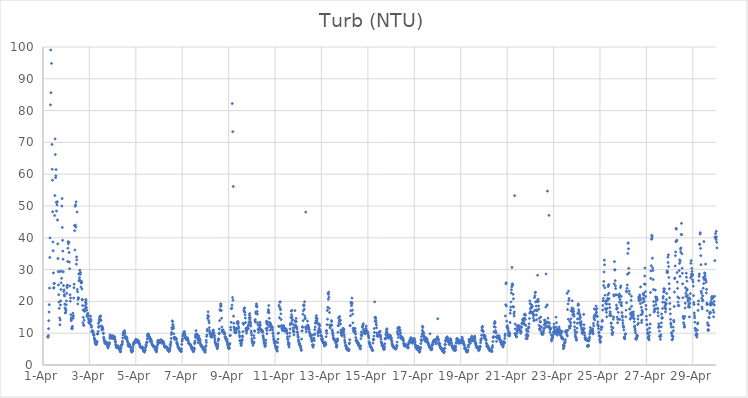
| Category | Turb (NTU) |
|---|---|
| 44287.208333333336 | 8.91 |
| 44287.21875 | 8.72 |
| 44287.229166666664 | 9.24 |
| 44287.239583333336 | 11.43 |
| 44287.25 | 13.94 |
| 44287.260416666664 | 16.67 |
| 44287.270833333336 | 18.98 |
| 44287.28125 | 24.19 |
| 44287.291666666664 | 33.81 |
| 44287.302083333336 | 39.97 |
| 44287.3125 | 102.34 |
| 44287.322916666664 | 81.81 |
| 44287.333333333336 | 99.06 |
| 44287.34375 | 85.61 |
| 44287.354166666664 | 104.05 |
| 44287.364583333336 | 94.84 |
| 44287.375 | 164.2 |
| 44287.385416666664 | 69.35 |
| 44287.395833333336 | 61.54 |
| 44287.40625 | 58.09 |
| 44287.416666666664 | 48.18 |
| 44287.427083333336 | 38.69 |
| 44287.4375 | 35.92 |
| 44287.447916666664 | 28.95 |
| 44287.458333333336 | 24.17 |
| 44287.46875 | 24.33 |
| 44287.479166666664 | 25.57 |
| 44287.489583333336 | 25.69 |
| 44287.5 | 47.01 |
| 44287.510416666664 | 53.28 |
| 44287.520833333336 | 71.09 |
| 44287.53125 | 66.18 |
| 44287.541666666664 | 58.92 |
| 44287.552083333336 | 59.51 |
| 44287.5625 | 61.44 |
| 44287.572916666664 | 51.14 |
| 44287.583333333336 | 48.4 |
| 44287.59375 | 51.13 |
| 44287.604166666664 | 50.33 |
| 44287.614583333336 | 51.34 |
| 44287.625 | 45.59 |
| 44287.635416666664 | 38.09 |
| 44287.645833333336 | 33.48 |
| 44287.65625 | 29.37 |
| 44287.666666666664 | 25.19 |
| 44287.677083333336 | 22.1 |
| 44287.6875 | 19.79 |
| 44287.697916666664 | 17.81 |
| 44287.708333333336 | 29.34 |
| 44287.71875 | 14.78 |
| 44287.729166666664 | 12.66 |
| 44287.739583333336 | 14.14 |
| 44287.75 | 18.86 |
| 44287.760416666664 | 20.18 |
| 44287.770833333336 | 23.73 |
| 44287.78125 | 25.83 |
| 44287.791666666664 | 29.49 |
| 44287.802083333336 | 27.25 |
| 44287.8125 | 49.99 |
| 44287.822916666664 | 52.34 |
| 44287.833333333336 | 43.26 |
| 44287.84375 | 39.22 |
| 44287.854166666664 | 35.82 |
| 44287.864583333336 | 33.27 |
| 44287.875 | 29.29 |
| 44287.885416666664 | 25 |
| 44287.895833333336 | 23.11 |
| 44287.90625 | 23.63 |
| 44287.916666666664 | 22.09 |
| 44287.927083333336 | 21.72 |
| 44287.9375 | 19.13 |
| 44287.947916666664 | 17.96 |
| 44287.958333333336 | 16.38 |
| 44287.96875 | 16.47 |
| 44287.979166666664 | 17.54 |
| 44287.989583333336 | 17.07 |
| 44288.0 | 18.92 |
| 44288.010416666664 | 20.16 |
| 44288.020833333336 | 22.56 |
| 44288.03125 | 24.86 |
| 44288.041666666664 | 24.35 |
| 44288.052083333336 | 25.1 |
| 44288.0625 | 32.56 |
| 44288.072916666664 | 36.73 |
| 44288.083333333336 | 38.78 |
| 44288.09375 | 38.14 |
| 44288.104166666664 | 38.54 |
| 44288.114583333336 | 38.61 |
| 44288.125 | 35.38 |
| 44288.135416666664 | 32.38 |
| 44288.145833333336 | 30.26 |
| 44288.15625 | 24.86 |
| 44288.166666666664 | 22.07 |
| 44288.177083333336 | 20.05 |
| 44288.1875 | 21.08 |
| 44288.197916666664 | 15.83 |
| 44288.208333333336 | 14.74 |
| 44288.21875 | 13.92 |
| 44288.229166666664 | 14.4 |
| 44288.239583333336 | 11.45 |
| 44288.25 | 11.78 |
| 44288.260416666664 | 11.39 |
| 44288.270833333336 | 12.16 |
| 44288.28125 | 15.26 |
| 44288.291666666664 | 16.3 |
| 44288.302083333336 | 14.73 |
| 44288.3125 | 15.52 |
| 44288.322916666664 | 21.05 |
| 44288.333333333336 | 24.31 |
| 44288.34375 | 25.4 |
| 44288.354166666664 | 43.85 |
| 44288.364583333336 | 42.23 |
| 44288.375 | 36.16 |
| 44288.385416666664 | 49.9 |
| 44288.395833333336 | 43.97 |
| 44288.40625 | 50.39 |
| 44288.416666666664 | 43.36 |
| 44288.427083333336 | 51.3 |
| 44288.4375 | 31.7 |
| 44288.447916666664 | 33.98 |
| 44288.458333333336 | 33.05 |
| 44288.46875 | 48.1 |
| 44288.479166666664 | 23.76 |
| 44288.489583333336 | 23.02 |
| 44288.5 | 19.2 |
| 44288.510416666664 | 20.63 |
| 44288.520833333336 | 21.19 |
| 44288.53125 | 21.06 |
| 44288.541666666664 | 28.63 |
| 44288.552083333336 | 26.62 |
| 44288.5625 | 26.48 |
| 44288.572916666664 | 27.46 |
| 44288.583333333336 | 29.78 |
| 44288.59375 | 28.84 |
| 44288.604166666664 | 28.49 |
| 44288.614583333336 | 29.09 |
| 44288.625 | 26.51 |
| 44288.635416666664 | 24.52 |
| 44288.645833333336 | 25.8 |
| 44288.65625 | 25.92 |
| 44288.666666666664 | 26.17 |
| 44288.677083333336 | 23.9 |
| 44288.6875 | 20.65 |
| 44288.697916666664 | 20.52 |
| 44288.708333333336 | 18.7 |
| 44288.71875 | 13.26 |
| 44288.729166666664 | 17.31 |
| 44288.739583333336 | 14.97 |
| 44288.75 | 12.45 |
| 44288.760416666664 | 12.56 |
| 44288.770833333336 | 14.08 |
| 44288.78125 | 17.08 |
| 44288.791666666664 | 16.86 |
| 44288.802083333336 | 17.09 |
| 44288.8125 | 18.61 |
| 44288.822916666664 | 17.75 |
| 44288.833333333336 | 19.64 |
| 44288.84375 | 20.57 |
| 44288.854166666664 | 20.09 |
| 44288.864583333336 | 19.21 |
| 44288.875 | 18.07 |
| 44288.885416666664 | 17.25 |
| 44288.895833333336 | 15.66 |
| 44288.90625 | 15.28 |
| 44288.916666666664 | 15.57 |
| 44288.927083333336 | 16.29 |
| 44288.9375 | 15.74 |
| 44288.947916666664 | 15.57 |
| 44288.958333333336 | 14.56 |
| 44288.96875 | 13.37 |
| 44288.979166666664 | 14.01 |
| 44288.989583333336 | 13.63 |
| 44289.0 | 13.2 |
| 44289.010416666664 | 13.24 |
| 44289.020833333336 | 12.96 |
| 44289.03125 | 13.87 |
| 44289.041666666664 | 14.1 |
| 44289.052083333336 | 15.31 |
| 44289.0625 | 14.32 |
| 44289.072916666664 | 13.83 |
| 44289.083333333336 | 12.42 |
| 44289.09375 | 11.89 |
| 44289.104166666664 | 10.5 |
| 44289.114583333336 | 10.43 |
| 44289.125 | 10.82 |
| 44289.135416666664 | 10.29 |
| 44289.145833333336 | 10.62 |
| 44289.15625 | 10.64 |
| 44289.166666666664 | 10.15 |
| 44289.177083333336 | 9.63 |
| 44289.1875 | 9.27 |
| 44289.197916666664 | 9.47 |
| 44289.208333333336 | 8.46 |
| 44289.21875 | 8.19 |
| 44289.229166666664 | 7.53 |
| 44289.239583333336 | 8.1 |
| 44289.25 | 6.83 |
| 44289.260416666664 | 7.27 |
| 44289.270833333336 | 6.76 |
| 44289.28125 | 6.47 |
| 44289.291666666664 | 6.46 |
| 44289.302083333336 | 6.51 |
| 44289.3125 | 6.87 |
| 44289.322916666664 | 7.47 |
| 44289.333333333336 | 7.19 |
| 44289.34375 | 9.79 |
| 44289.354166666664 | 9.87 |
| 44289.364583333336 | 9.78 |
| 44289.375 | 10.56 |
| 44289.385416666664 | 13.07 |
| 44289.395833333336 | 11.84 |
| 44289.40625 | 12.15 |
| 44289.416666666664 | 14.19 |
| 44289.427083333336 | 13.6 |
| 44289.4375 | 15.07 |
| 44289.447916666664 | 14.41 |
| 44289.458333333336 | 14.48 |
| 44289.46875 | 15.32 |
| 44289.479166666664 | 15.41 |
| 44289.489583333336 | 14.07 |
| 44289.5 | 14.09 |
| 44289.510416666664 | 12.2 |
| 44289.520833333336 | 12.24 |
| 44289.53125 | 10.98 |
| 44289.541666666664 | 11.55 |
| 44289.552083333336 | 11.33 |
| 44289.5625 | 11.87 |
| 44289.572916666664 | 11.67 |
| 44289.583333333336 | 11.2 |
| 44289.59375 | 10.05 |
| 44289.604166666664 | 9.91 |
| 44289.614583333336 | 8.73 |
| 44289.625 | 8.25 |
| 44289.635416666664 | 7.83 |
| 44289.645833333336 | 7.73 |
| 44289.65625 | 7.22 |
| 44289.666666666664 | 7.1 |
| 44289.677083333336 | 6.79 |
| 44289.6875 | 6.76 |
| 44289.697916666664 | 7.11 |
| 44289.708333333336 | 7.02 |
| 44289.71875 | 6.75 |
| 44289.729166666664 | 7.21 |
| 44289.739583333336 | 6.53 |
| 44289.75 | 6.51 |
| 44289.760416666664 | 6.48 |
| 44289.770833333336 | 6.54 |
| 44289.78125 | 5.94 |
| 44289.791666666664 | 5.68 |
| 44289.802083333336 | 5.34 |
| 44289.8125 | 5.8 |
| 44289.822916666664 | 5.98 |
| 44289.833333333336 | 6.78 |
| 44289.84375 | 6.99 |
| 44289.854166666664 | 7 |
| 44289.864583333336 | 6.62 |
| 44289.875 | 8.41 |
| 44289.885416666664 | 9.08 |
| 44289.895833333336 | 9.49 |
| 44289.90625 | 9.19 |
| 44289.916666666664 | 9.03 |
| 44289.927083333336 | 8.88 |
| 44289.9375 | 8.56 |
| 44289.947916666664 | 8.35 |
| 44289.958333333336 | 8.95 |
| 44289.96875 | 8.65 |
| 44289.979166666664 | 8.78 |
| 44289.989583333336 | 8.98 |
| 44290.0 | 9.23 |
| 44290.010416666664 | 8.91 |
| 44290.020833333336 | 8.36 |
| 44290.03125 | 8.31 |
| 44290.041666666664 | 8.47 |
| 44290.052083333336 | 8.52 |
| 44290.0625 | 8.34 |
| 44290.072916666664 | 8.98 |
| 44290.083333333336 | 8.75 |
| 44290.09375 | 8.48 |
| 44290.104166666664 | 7.93 |
| 44290.114583333336 | 7.44 |
| 44290.125 | 7.07 |
| 44290.135416666664 | 6.42 |
| 44290.145833333336 | 6.02 |
| 44290.15625 | 5.95 |
| 44290.166666666664 | 5.48 |
| 44290.177083333336 | 5.58 |
| 44290.1875 | 5.41 |
| 44290.197916666664 | 5.56 |
| 44290.208333333336 | 5.7 |
| 44290.21875 | 5.94 |
| 44290.229166666664 | 5.97 |
| 44290.239583333336 | 5.97 |
| 44290.25 | 5.65 |
| 44290.260416666664 | 5.41 |
| 44290.270833333336 | 5.48 |
| 44290.28125 | 5.01 |
| 44290.291666666664 | 5.03 |
| 44290.302083333336 | 5.03 |
| 44290.3125 | 4.47 |
| 44290.322916666664 | 4.71 |
| 44290.333333333336 | 4.17 |
| 44290.34375 | 4.2 |
| 44290.354166666664 | 5.1 |
| 44290.364583333336 | 5.6 |
| 44290.375 | 6.12 |
| 44290.385416666664 | 6.22 |
| 44290.395833333336 | 6.41 |
| 44290.40625 | 6.48 |
| 44290.416666666664 | 6.93 |
| 44290.427083333336 | 7.47 |
| 44290.4375 | 8.5 |
| 44290.447916666664 | 9.44 |
| 44290.458333333336 | 9.98 |
| 44290.46875 | 10.38 |
| 44290.479166666664 | 10.08 |
| 44290.489583333336 | 10 |
| 44290.5 | 9.67 |
| 44290.510416666664 | 10.04 |
| 44290.520833333336 | 10.76 |
| 44290.53125 | 10.01 |
| 44290.541666666664 | 8.93 |
| 44290.552083333336 | 8.58 |
| 44290.5625 | 8.33 |
| 44290.572916666664 | 8.35 |
| 44290.583333333336 | 8.18 |
| 44290.59375 | 8.91 |
| 44290.604166666664 | 8.39 |
| 44290.614583333336 | 8.4 |
| 44290.625 | 8.31 |
| 44290.635416666664 | 7.54 |
| 44290.645833333336 | 7.44 |
| 44290.65625 | 7 |
| 44290.666666666664 | 6.43 |
| 44290.677083333336 | 5.89 |
| 44290.6875 | 6.58 |
| 44290.697916666664 | 6.7 |
| 44290.708333333336 | 6.26 |
| 44290.71875 | 5.95 |
| 44290.729166666664 | 6.19 |
| 44290.739583333336 | 6.39 |
| 44290.75 | 5.7 |
| 44290.760416666664 | 5.66 |
| 44290.770833333336 | 5.58 |
| 44290.78125 | 5.59 |
| 44290.791666666664 | 4.55 |
| 44290.802083333336 | 4.78 |
| 44290.8125 | 4.63 |
| 44290.822916666664 | 4.03 |
| 44290.833333333336 | 4.19 |
| 44290.84375 | 4.31 |
| 44290.854166666664 | 4.37 |
| 44290.864583333336 | 4.75 |
| 44290.875 | 5.4 |
| 44290.885416666664 | 6.14 |
| 44290.895833333336 | 6.68 |
| 44290.90625 | 6.6 |
| 44290.916666666664 | 6.98 |
| 44290.927083333336 | 6.98 |
| 44290.9375 | 7.15 |
| 44290.947916666664 | 7.17 |
| 44290.958333333336 | 7.32 |
| 44290.96875 | 7.63 |
| 44290.979166666664 | 7.11 |
| 44290.989583333336 | 7.49 |
| 44291.0 | 8.08 |
| 44291.010416666664 | 7.45 |
| 44291.020833333336 | 7.96 |
| 44291.03125 | 7.57 |
| 44291.041666666664 | 7.87 |
| 44291.052083333336 | 7.61 |
| 44291.0625 | 7.09 |
| 44291.072916666664 | 7.77 |
| 44291.083333333336 | 7.63 |
| 44291.09375 | 7.8 |
| 44291.104166666664 | 7.33 |
| 44291.114583333336 | 7.23 |
| 44291.125 | 7.39 |
| 44291.135416666664 | 7.06 |
| 44291.145833333336 | 6.78 |
| 44291.15625 | 6.65 |
| 44291.166666666664 | 6.38 |
| 44291.177083333336 | 5.99 |
| 44291.1875 | 5.89 |
| 44291.197916666664 | 5.72 |
| 44291.208333333336 | 5.53 |
| 44291.21875 | 5.5 |
| 44291.229166666664 | 5.47 |
| 44291.239583333336 | 5.5 |
| 44291.25 | 5.43 |
| 44291.260416666664 | 5.43 |
| 44291.270833333336 | 5.6 |
| 44291.28125 | 5.68 |
| 44291.291666666664 | 5.31 |
| 44291.302083333336 | 5.29 |
| 44291.3125 | 4.88 |
| 44291.322916666664 | 5.03 |
| 44291.333333333336 | 4.32 |
| 44291.34375 | 4.65 |
| 44291.354166666664 | 4.41 |
| 44291.364583333336 | 4.15 |
| 44291.375 | 4.05 |
| 44291.385416666664 | 4.43 |
| 44291.395833333336 | 4.67 |
| 44291.40625 | 4.67 |
| 44291.416666666664 | 5.51 |
| 44291.427083333336 | 5.58 |
| 44291.4375 | 6.37 |
| 44291.447916666664 | 6.09 |
| 44291.458333333336 | 7 |
| 44291.46875 | 7.14 |
| 44291.479166666664 | 7.13 |
| 44291.489583333336 | 8.17 |
| 44291.5 | 9.09 |
| 44291.510416666664 | 9.66 |
| 44291.520833333336 | 9.41 |
| 44291.53125 | 9.71 |
| 44291.541666666664 | 9.69 |
| 44291.552083333336 | 9.48 |
| 44291.5625 | 8.76 |
| 44291.572916666664 | 8.66 |
| 44291.583333333336 | 8.52 |
| 44291.59375 | 8.94 |
| 44291.604166666664 | 7.93 |
| 44291.614583333336 | 7.43 |
| 44291.625 | 8.19 |
| 44291.635416666664 | 8.21 |
| 44291.645833333336 | 8.2 |
| 44291.65625 | 7.59 |
| 44291.666666666664 | 7.8 |
| 44291.677083333336 | 7.37 |
| 44291.6875 | 6.85 |
| 44291.697916666664 | 6.6 |
| 44291.708333333336 | 6.42 |
| 44291.71875 | 6.24 |
| 44291.729166666664 | 6.16 |
| 44291.739583333336 | 6.13 |
| 44291.75 | 5.92 |
| 44291.760416666664 | 5.8 |
| 44291.770833333336 | 5.68 |
| 44291.78125 | 5.76 |
| 44291.791666666664 | 5.89 |
| 44291.802083333336 | 5.73 |
| 44291.8125 | 5.79 |
| 44291.822916666664 | 5.51 |
| 44291.833333333336 | 4.81 |
| 44291.84375 | 5.04 |
| 44291.854166666664 | 4.59 |
| 44291.864583333336 | 4.74 |
| 44291.875 | 4.44 |
| 44291.885416666664 | 4.1 |
| 44291.895833333336 | 4.36 |
| 44291.90625 | 5.07 |
| 44291.916666666664 | 5.58 |
| 44291.927083333336 | 6.19 |
| 44291.9375 | 7.08 |
| 44291.947916666664 | 7.74 |
| 44291.958333333336 | 7.15 |
| 44291.96875 | 6.77 |
| 44291.979166666664 | 7.27 |
| 44291.989583333336 | 7.61 |
| 44292.0 | 7.34 |
| 44292.010416666664 | 7.15 |
| 44292.020833333336 | 7.02 |
| 44292.03125 | 7.28 |
| 44292.041666666664 | 7.62 |
| 44292.052083333336 | 7.39 |
| 44292.0625 | 7.65 |
| 44292.072916666664 | 7.68 |
| 44292.083333333336 | 7.97 |
| 44292.09375 | 7.8 |
| 44292.104166666664 | 7.69 |
| 44292.114583333336 | 6.99 |
| 44292.125 | 6.85 |
| 44292.135416666664 | 7.48 |
| 44292.145833333336 | 7.43 |
| 44292.15625 | 7.03 |
| 44292.166666666664 | 7.26 |
| 44292.177083333336 | 7.42 |
| 44292.1875 | 7.2 |
| 44292.197916666664 | 6.98 |
| 44292.208333333336 | 6.84 |
| 44292.21875 | 6.34 |
| 44292.229166666664 | 6.11 |
| 44292.239583333336 | 5.68 |
| 44292.25 | 5.81 |
| 44292.260416666664 | 5.67 |
| 44292.270833333336 | 5.59 |
| 44292.28125 | 5.61 |
| 44292.291666666664 | 5.52 |
| 44292.302083333336 | 5.46 |
| 44292.3125 | 5.67 |
| 44292.322916666664 | 5.68 |
| 44292.333333333336 | 5.57 |
| 44292.34375 | 5.34 |
| 44292.354166666664 | 5.23 |
| 44292.364583333336 | 5.34 |
| 44292.375 | 4.81 |
| 44292.385416666664 | 4.65 |
| 44292.395833333336 | 5.09 |
| 44292.40625 | 4.65 |
| 44292.416666666664 | 4.3 |
| 44292.427083333336 | 4.29 |
| 44292.4375 | 4.42 |
| 44292.447916666664 | 4.34 |
| 44292.458333333336 | 4.92 |
| 44292.46875 | 5.1 |
| 44292.479166666664 | 6.37 |
| 44292.489583333336 | 5.82 |
| 44292.5 | 6.65 |
| 44292.510416666664 | 7.33 |
| 44292.520833333336 | 8.37 |
| 44292.53125 | 9.61 |
| 44292.541666666664 | 10.21 |
| 44292.552083333336 | 11.71 |
| 44292.5625 | 11.26 |
| 44292.572916666664 | 13.88 |
| 44292.583333333336 | 13.65 |
| 44292.59375 | 12.62 |
| 44292.604166666664 | 12.69 |
| 44292.614583333336 | 12.04 |
| 44292.625 | 11.52 |
| 44292.635416666664 | 9.82 |
| 44292.645833333336 | 8.66 |
| 44292.65625 | 8.64 |
| 44292.666666666664 | 8.1 |
| 44292.677083333336 | 8.58 |
| 44292.6875 | 8.42 |
| 44292.697916666664 | 8.54 |
| 44292.708333333336 | 8.48 |
| 44292.71875 | 8.53 |
| 44292.729166666664 | 8.23 |
| 44292.739583333336 | 8.35 |
| 44292.75 | 7.95 |
| 44292.760416666664 | 7.25 |
| 44292.770833333336 | 6.76 |
| 44292.78125 | 6.88 |
| 44292.791666666664 | 6.37 |
| 44292.802083333336 | 6.48 |
| 44292.8125 | 5.74 |
| 44292.822916666664 | 5.61 |
| 44292.833333333336 | 5.67 |
| 44292.84375 | 5.34 |
| 44292.854166666664 | 5.23 |
| 44292.864583333336 | 5.17 |
| 44292.875 | 5.24 |
| 44292.885416666664 | 4.94 |
| 44292.895833333336 | 4.74 |
| 44292.90625 | 4.52 |
| 44292.916666666664 | 4.56 |
| 44292.927083333336 | 4.53 |
| 44292.9375 | 4.33 |
| 44292.947916666664 | 4.18 |
| 44292.958333333336 | 4.29 |
| 44292.96875 | 5.09 |
| 44292.979166666664 | 6.47 |
| 44292.989583333336 | 7.47 |
| 44293.0 | 7.86 |
| 44293.010416666664 | 8.27 |
| 44293.020833333336 | 9.04 |
| 44293.03125 | 9.46 |
| 44293.041666666664 | 9.77 |
| 44293.052083333336 | 9.51 |
| 44293.0625 | 9.98 |
| 44293.072916666664 | 10.05 |
| 44293.083333333336 | 10.51 |
| 44293.09375 | 10.39 |
| 44293.104166666664 | 9.7 |
| 44293.114583333336 | 9.49 |
| 44293.125 | 8.87 |
| 44293.135416666664 | 8.48 |
| 44293.145833333336 | 8.27 |
| 44293.15625 | 8.88 |
| 44293.166666666664 | 8.3 |
| 44293.177083333336 | 8.46 |
| 44293.1875 | 7.94 |
| 44293.197916666664 | 8.16 |
| 44293.208333333336 | 8.04 |
| 44293.21875 | 8.3 |
| 44293.229166666664 | 8.34 |
| 44293.239583333336 | 8.47 |
| 44293.25 | 7.85 |
| 44293.260416666664 | 7.59 |
| 44293.270833333336 | 6.8 |
| 44293.28125 | 6.98 |
| 44293.291666666664 | 6.88 |
| 44293.302083333336 | 6.73 |
| 44293.3125 | 6.49 |
| 44293.322916666664 | 6.63 |
| 44293.333333333336 | 6.51 |
| 44293.34375 | 6.37 |
| 44293.354166666664 | 6.42 |
| 44293.364583333336 | 6.04 |
| 44293.375 | 6.13 |
| 44293.385416666664 | 5.91 |
| 44293.395833333336 | 5.62 |
| 44293.40625 | 5.13 |
| 44293.416666666664 | 5.46 |
| 44293.427083333336 | 4.91 |
| 44293.4375 | 5.02 |
| 44293.447916666664 | 5.13 |
| 44293.458333333336 | 4.67 |
| 44293.46875 | 4.26 |
| 44293.479166666664 | 4.43 |
| 44293.489583333336 | 4.2 |
| 44293.5 | 5.22 |
| 44293.510416666664 | 5.4 |
| 44293.520833333336 | 4.98 |
| 44293.53125 | 6.71 |
| 44293.541666666664 | 7.03 |
| 44293.552083333336 | 7.56 |
| 44293.5625 | 9.08 |
| 44293.572916666664 | 8.68 |
| 44293.583333333336 | 9.68 |
| 44293.59375 | 10.81 |
| 44293.604166666664 | 9.15 |
| 44293.614583333336 | 9.72 |
| 44293.625 | 9.55 |
| 44293.635416666664 | 9.71 |
| 44293.645833333336 | 9.51 |
| 44293.65625 | 9.02 |
| 44293.666666666664 | 8.38 |
| 44293.677083333336 | 8.05 |
| 44293.6875 | 7 |
| 44293.697916666664 | 7.72 |
| 44293.708333333336 | 7.96 |
| 44293.71875 | 9.13 |
| 44293.729166666664 | 8.47 |
| 44293.739583333336 | 8.29 |
| 44293.75 | 8 |
| 44293.760416666664 | 7.85 |
| 44293.770833333336 | 7.54 |
| 44293.78125 | 6.88 |
| 44293.791666666664 | 6.36 |
| 44293.802083333336 | 6.14 |
| 44293.8125 | 6.34 |
| 44293.822916666664 | 6.21 |
| 44293.833333333336 | 6.03 |
| 44293.84375 | 5.73 |
| 44293.854166666664 | 5.56 |
| 44293.864583333336 | 5.65 |
| 44293.875 | 5.58 |
| 44293.885416666664 | 5.59 |
| 44293.895833333336 | 5.41 |
| 44293.90625 | 4.89 |
| 44293.916666666664 | 4.85 |
| 44293.927083333336 | 5.37 |
| 44293.9375 | 4.9 |
| 44293.947916666664 | 5.02 |
| 44293.958333333336 | 4.62 |
| 44293.96875 | 4.12 |
| 44293.979166666664 | 4.37 |
| 44293.989583333336 | 4.04 |
| 44294.0 | 4.79 |
| 44294.010416666664 | 5.81 |
| 44294.020833333336 | 6.09 |
| 44294.03125 | 7.79 |
| 44294.041666666664 | 7.09 |
| 44294.052083333336 | 9.01 |
| 44294.0625 | 9.45 |
| 44294.072916666664 | 10.74 |
| 44294.083333333336 | 11.21 |
| 44294.09375 | 14.66 |
| 44294.104166666664 | 15.59 |
| 44294.114583333336 | 16.73 |
| 44294.125 | 15.17 |
| 44294.135416666664 | 15.26 |
| 44294.145833333336 | 13.95 |
| 44294.15625 | 13.24 |
| 44294.166666666664 | 11.74 |
| 44294.177083333336 | 10.77 |
| 44294.1875 | 10.2 |
| 44294.197916666664 | 9.74 |
| 44294.208333333336 | 9.97 |
| 44294.21875 | 9.51 |
| 44294.229166666664 | 8.98 |
| 44294.239583333336 | 9.1 |
| 44294.25 | 8.84 |
| 44294.260416666664 | 8.75 |
| 44294.270833333336 | 8.94 |
| 44294.28125 | 9.32 |
| 44294.291666666664 | 9.94 |
| 44294.302083333336 | 9.58 |
| 44294.3125 | 10.23 |
| 44294.322916666664 | 10.33 |
| 44294.333333333336 | 11.01 |
| 44294.34375 | 10.8 |
| 44294.354166666664 | 10.16 |
| 44294.364583333336 | 9.79 |
| 44294.375 | 9.41 |
| 44294.385416666664 | 9.15 |
| 44294.395833333336 | 8.53 |
| 44294.40625 | 7.89 |
| 44294.416666666664 | 7.12 |
| 44294.427083333336 | 7.12 |
| 44294.4375 | 6.79 |
| 44294.447916666664 | 6.5 |
| 44294.458333333336 | 6.57 |
| 44294.46875 | 6.35 |
| 44294.479166666664 | 6.14 |
| 44294.489583333336 | 5.85 |
| 44294.5 | 5.4 |
| 44294.510416666664 | 5.09 |
| 44294.520833333336 | 5.62 |
| 44294.53125 | 5.9 |
| 44294.541666666664 | 6.58 |
| 44294.552083333336 | 7.58 |
| 44294.5625 | 8.16 |
| 44294.572916666664 | 8.16 |
| 44294.583333333336 | 9.85 |
| 44294.59375 | 11.33 |
| 44294.604166666664 | 10.02 |
| 44294.614583333336 | 13.98 |
| 44294.625 | 17.4 |
| 44294.635416666664 | 17.15 |
| 44294.645833333336 | 18.46 |
| 44294.65625 | 19.13 |
| 44294.666666666664 | 19.23 |
| 44294.677083333336 | 18.56 |
| 44294.6875 | 17.15 |
| 44294.697916666664 | 14.71 |
| 44294.708333333336 | 11.95 |
| 44294.71875 | 10.96 |
| 44294.729166666664 | 10.51 |
| 44294.739583333336 | 10.46 |
| 44294.75 | 10.83 |
| 44294.760416666664 | 11.05 |
| 44294.770833333336 | 10.53 |
| 44294.78125 | 10.5 |
| 44294.791666666664 | 10.26 |
| 44294.802083333336 | 9.79 |
| 44294.8125 | 9.97 |
| 44294.822916666664 | 10.11 |
| 44294.833333333336 | 9.81 |
| 44294.84375 | 8.91 |
| 44294.854166666664 | 8.62 |
| 44294.864583333336 | 8.83 |
| 44294.875 | 8.14 |
| 44294.885416666664 | 8.29 |
| 44294.895833333336 | 8.23 |
| 44294.90625 | 7.97 |
| 44294.916666666664 | 8 |
| 44294.927083333336 | 7.35 |
| 44294.9375 | 7.31 |
| 44294.947916666664 | 6.87 |
| 44294.958333333336 | 6.43 |
| 44294.96875 | 6.11 |
| 44294.979166666664 | 5.89 |
| 44294.989583333336 | 5.44 |
| 44295.0 | 5.24 |
| 44295.010416666664 | 5.13 |
| 44295.020833333336 | 5.21 |
| 44295.03125 | 5.38 |
| 44295.041666666664 | 6.39 |
| 44295.052083333336 | 6.76 |
| 44295.0625 | 9.21 |
| 44295.072916666664 | 9.33 |
| 44295.083333333336 | 11.84 |
| 44295.09375 | 11.02 |
| 44295.104166666664 | 13.42 |
| 44295.114583333336 | 17.73 |
| 44295.125 | 17.77 |
| 44295.135416666664 | 17.89 |
| 44295.145833333336 | 18.82 |
| 44295.15625 | 82.21 |
| 44295.166666666664 | 21.22 |
| 44295.177083333336 | 73.37 |
| 44295.1875 | 20.36 |
| 44295.197916666664 | 56.12 |
| 44295.208333333336 | 15.34 |
| 44295.21875 | 13.15 |
| 44295.229166666664 | 11.96 |
| 44295.239583333336 | 11.68 |
| 44295.25 | 11.11 |
| 44295.260416666664 | 10.35 |
| 44295.270833333336 | 10.44 |
| 44295.28125 | 10.22 |
| 44295.291666666664 | 10.49 |
| 44295.302083333336 | 10.29 |
| 44295.3125 | 10.04 |
| 44295.322916666664 | 11.43 |
| 44295.333333333336 | 11 |
| 44295.34375 | 11.44 |
| 44295.354166666664 | 11.41 |
| 44295.364583333336 | 13.15 |
| 44295.375 | 13.4 |
| 44295.385416666664 | 13.69 |
| 44295.395833333336 | 13.14 |
| 44295.40625 | 12.88 |
| 44295.416666666664 | 13.51 |
| 44295.427083333336 | 12.1 |
| 44295.4375 | 11.53 |
| 44295.447916666664 | 10.54 |
| 44295.458333333336 | 10.17 |
| 44295.46875 | 9.27 |
| 44295.479166666664 | 8.81 |
| 44295.489583333336 | 7.64 |
| 44295.5 | 7.68 |
| 44295.510416666664 | 7.54 |
| 44295.520833333336 | 6.81 |
| 44295.53125 | 6.2 |
| 44295.541666666664 | 6.22 |
| 44295.552083333336 | 6.74 |
| 44295.5625 | 7.45 |
| 44295.572916666664 | 7.73 |
| 44295.583333333336 | 8.02 |
| 44295.59375 | 9.14 |
| 44295.604166666664 | 8.9 |
| 44295.614583333336 | 10.51 |
| 44295.625 | 13 |
| 44295.635416666664 | 13.14 |
| 44295.645833333336 | 12.83 |
| 44295.65625 | 17.08 |
| 44295.666666666664 | 17.77 |
| 44295.677083333336 | 16.83 |
| 44295.6875 | 17.96 |
| 44295.697916666664 | 16.54 |
| 44295.708333333336 | 15.77 |
| 44295.71875 | 14.77 |
| 44295.729166666664 | 13.35 |
| 44295.739583333336 | 11.49 |
| 44295.75 | 10.9 |
| 44295.760416666664 | 10.74 |
| 44295.770833333336 | 10 |
| 44295.78125 | 10.75 |
| 44295.791666666664 | 11.16 |
| 44295.802083333336 | 11.31 |
| 44295.8125 | 11.87 |
| 44295.822916666664 | 11.83 |
| 44295.833333333336 | 11.55 |
| 44295.84375 | 11.41 |
| 44295.854166666664 | 12.43 |
| 44295.864583333336 | 12.83 |
| 44295.875 | 13.55 |
| 44295.885416666664 | 14.75 |
| 44295.895833333336 | 15.6 |
| 44295.90625 | 16.17 |
| 44295.916666666664 | 14.24 |
| 44295.927083333336 | 14.96 |
| 44295.9375 | 13.53 |
| 44295.947916666664 | 12.96 |
| 44295.958333333336 | 12.23 |
| 44295.96875 | 10.73 |
| 44295.979166666664 | 10.09 |
| 44295.989583333336 | 9.37 |
| 44296.0 | 8.26 |
| 44296.010416666664 | 7.74 |
| 44296.020833333336 | 7.33 |
| 44296.03125 | 6.94 |
| 44296.041666666664 | 6.69 |
| 44296.052083333336 | 6.2 |
| 44296.0625 | 7.2 |
| 44296.072916666664 | 6.86 |
| 44296.083333333336 | 9.25 |
| 44296.09375 | 7.12 |
| 44296.104166666664 | 8.48 |
| 44296.114583333336 | 10.75 |
| 44296.125 | 10.62 |
| 44296.135416666664 | 13.92 |
| 44296.145833333336 | 14.27 |
| 44296.15625 | 13.48 |
| 44296.166666666664 | 16.67 |
| 44296.177083333336 | 16.16 |
| 44296.1875 | 18.51 |
| 44296.197916666664 | 19.2 |
| 44296.208333333336 | 18.66 |
| 44296.21875 | 18.25 |
| 44296.229166666664 | 16.83 |
| 44296.239583333336 | 15.99 |
| 44296.25 | 13.28 |
| 44296.260416666664 | 12.62 |
| 44296.270833333336 | 11.1 |
| 44296.28125 | 11.24 |
| 44296.291666666664 | 10.22 |
| 44296.302083333336 | 11.1 |
| 44296.3125 | 11.66 |
| 44296.322916666664 | 11.44 |
| 44296.333333333336 | 11.99 |
| 44296.34375 | 12.73 |
| 44296.354166666664 | 13.46 |
| 44296.364583333336 | 12.56 |
| 44296.375 | 11.3 |
| 44296.385416666664 | 10.89 |
| 44296.395833333336 | 10.87 |
| 44296.40625 | 11.13 |
| 44296.416666666664 | 10.9 |
| 44296.427083333336 | 10.87 |
| 44296.4375 | 10.43 |
| 44296.447916666664 | 10.64 |
| 44296.458333333336 | 10.74 |
| 44296.46875 | 10.26 |
| 44296.479166666664 | 9.27 |
| 44296.489583333336 | 8.87 |
| 44296.5 | 8.39 |
| 44296.510416666664 | 7.86 |
| 44296.520833333336 | 7.23 |
| 44296.53125 | 6.83 |
| 44296.541666666664 | 6.89 |
| 44296.552083333336 | 6.5 |
| 44296.5625 | 5.84 |
| 44296.572916666664 | 5.95 |
| 44296.583333333336 | 6.2 |
| 44296.59375 | 6.93 |
| 44296.604166666664 | 7.81 |
| 44296.614583333336 | 11.43 |
| 44296.625 | 13.76 |
| 44296.635416666664 | 13.12 |
| 44296.645833333336 | 9.84 |
| 44296.65625 | 10.83 |
| 44296.666666666664 | 11.66 |
| 44296.677083333336 | 12.65 |
| 44296.6875 | 13.55 |
| 44296.697916666664 | 16.59 |
| 44296.708333333336 | 17.4 |
| 44296.71875 | 16.95 |
| 44296.729166666664 | 18.7 |
| 44296.739583333336 | 16.4 |
| 44296.75 | 14.68 |
| 44296.760416666664 | 12.18 |
| 44296.770833333336 | 13 |
| 44296.78125 | 13.33 |
| 44296.791666666664 | 10.98 |
| 44296.802083333336 | 12.03 |
| 44296.8125 | 12.87 |
| 44296.822916666664 | 12.47 |
| 44296.833333333336 | 12.02 |
| 44296.84375 | 12.24 |
| 44296.854166666664 | 11.77 |
| 44296.864583333336 | 11.71 |
| 44296.875 | 11.43 |
| 44296.885416666664 | 11.86 |
| 44296.895833333336 | 10.92 |
| 44296.90625 | 10.06 |
| 44296.916666666664 | 9.9 |
| 44296.927083333336 | 9.08 |
| 44296.9375 | 8.34 |
| 44296.947916666664 | 7.9 |
| 44296.958333333336 | 7.53 |
| 44296.96875 | 7.35 |
| 44296.979166666664 | 6.77 |
| 44296.989583333336 | 6.9 |
| 44297.0 | 6.77 |
| 44297.010416666664 | 6.01 |
| 44297.020833333336 | 5.82 |
| 44297.03125 | 7.42 |
| 44297.041666666664 | 5.19 |
| 44297.052083333336 | 5.43 |
| 44297.0625 | 5.16 |
| 44297.072916666664 | 5.04 |
| 44297.083333333336 | 4.65 |
| 44297.09375 | 4.35 |
| 44297.104166666664 | 5.65 |
| 44297.114583333336 | 7.04 |
| 44297.125 | 8.13 |
| 44297.135416666664 | 9.92 |
| 44297.145833333336 | 10.07 |
| 44297.15625 | 12.18 |
| 44297.166666666664 | 18.74 |
| 44297.177083333336 | 12.16 |
| 44297.1875 | 14.89 |
| 44297.197916666664 | 18.14 |
| 44297.208333333336 | 19.72 |
| 44297.21875 | 19.88 |
| 44297.229166666664 | 17.42 |
| 44297.239583333336 | 17.46 |
| 44297.25 | 16.09 |
| 44297.260416666664 | 14.3 |
| 44297.270833333336 | 12.1 |
| 44297.28125 | 12.41 |
| 44297.291666666664 | 11.6 |
| 44297.302083333336 | 11.37 |
| 44297.3125 | 10.9 |
| 44297.322916666664 | 11.08 |
| 44297.333333333336 | 11.43 |
| 44297.34375 | 11.83 |
| 44297.354166666664 | 12.35 |
| 44297.364583333336 | 12.08 |
| 44297.375 | 12.31 |
| 44297.385416666664 | 11.58 |
| 44297.395833333336 | 10.73 |
| 44297.40625 | 10.71 |
| 44297.416666666664 | 11.43 |
| 44297.427083333336 | 10.99 |
| 44297.4375 | 10.86 |
| 44297.447916666664 | 11.1 |
| 44297.458333333336 | 11.43 |
| 44297.46875 | 11.01 |
| 44297.479166666664 | 11.27 |
| 44297.489583333336 | 10.64 |
| 44297.5 | 10.76 |
| 44297.510416666664 | 10.17 |
| 44297.520833333336 | 9.88 |
| 44297.53125 | 8.87 |
| 44297.541666666664 | 8.28 |
| 44297.552083333336 | 8.07 |
| 44297.5625 | 7.31 |
| 44297.572916666664 | 6.46 |
| 44297.583333333336 | 6.84 |
| 44297.59375 | 6.22 |
| 44297.604166666664 | 5.61 |
| 44297.614583333336 | 6.62 |
| 44297.625 | 9.01 |
| 44297.635416666664 | 10.07 |
| 44297.645833333336 | 11.32 |
| 44297.65625 | 12.63 |
| 44297.666666666664 | 13.06 |
| 44297.677083333336 | 13.13 |
| 44297.6875 | 14.88 |
| 44297.697916666664 | 16.92 |
| 44297.708333333336 | 15.83 |
| 44297.71875 | 17.16 |
| 44297.729166666664 | 15.2 |
| 44297.739583333336 | 13.94 |
| 44297.75 | 14.31 |
| 44297.760416666664 | 12.88 |
| 44297.770833333336 | 11.67 |
| 44297.78125 | 10.84 |
| 44297.791666666664 | 10.5 |
| 44297.802083333336 | 10.79 |
| 44297.8125 | 9.47 |
| 44297.822916666664 | 10.38 |
| 44297.833333333336 | 11.72 |
| 44297.84375 | 12.37 |
| 44297.854166666664 | 17.11 |
| 44297.864583333336 | 13.89 |
| 44297.875 | 13.64 |
| 44297.885416666664 | 12.57 |
| 44297.895833333336 | 12.01 |
| 44297.90625 | 14.66 |
| 44297.916666666664 | 13.67 |
| 44297.927083333336 | 11.81 |
| 44297.9375 | 11.98 |
| 44297.947916666664 | 11.3 |
| 44297.958333333336 | 10.44 |
| 44297.96875 | 10.2 |
| 44297.979166666664 | 9.45 |
| 44297.989583333336 | 8.91 |
| 44298.0 | 8.66 |
| 44298.010416666664 | 7.86 |
| 44298.020833333336 | 7.39 |
| 44298.03125 | 7.11 |
| 44298.041666666664 | 6.59 |
| 44298.052083333336 | 6.41 |
| 44298.0625 | 6.63 |
| 44298.072916666664 | 6.16 |
| 44298.083333333336 | 5.98 |
| 44298.09375 | 5.81 |
| 44298.104166666664 | 5.68 |
| 44298.114583333336 | 5.16 |
| 44298.125 | 4.66 |
| 44298.135416666664 | 4.62 |
| 44298.145833333336 | 8.14 |
| 44298.15625 | 10.71 |
| 44298.166666666664 | 10.72 |
| 44298.177083333336 | 12.03 |
| 44298.1875 | 11.86 |
| 44298.197916666664 | 15.99 |
| 44298.208333333336 | 13.93 |
| 44298.21875 | 17.07 |
| 44298.229166666664 | 18.66 |
| 44298.239583333336 | 18.94 |
| 44298.25 | 18.73 |
| 44298.260416666664 | 17.56 |
| 44298.270833333336 | 19.89 |
| 44298.28125 | 15.46 |
| 44298.291666666664 | 14.57 |
| 44298.302083333336 | 14.69 |
| 44298.3125 | 11.92 |
| 44298.322916666664 | 48.08 |
| 44298.333333333336 | 11.36 |
| 44298.34375 | 10.48 |
| 44298.354166666664 | 11.23 |
| 44298.364583333336 | 11.8 |
| 44298.375 | 11.92 |
| 44298.385416666664 | 12.21 |
| 44298.395833333336 | 13.81 |
| 44298.40625 | 12.54 |
| 44298.416666666664 | 12.44 |
| 44298.427083333336 | 11.88 |
| 44298.4375 | 11.67 |
| 44298.447916666664 | 11.87 |
| 44298.458333333336 | 11.2 |
| 44298.46875 | 11.12 |
| 44298.479166666664 | 10.33 |
| 44298.489583333336 | 10.19 |
| 44298.5 | 9.9 |
| 44298.510416666664 | 9.16 |
| 44298.520833333336 | 9.5 |
| 44298.53125 | 9.21 |
| 44298.541666666664 | 9.29 |
| 44298.552083333336 | 8.8 |
| 44298.5625 | 8.44 |
| 44298.572916666664 | 8.15 |
| 44298.583333333336 | 7.44 |
| 44298.59375 | 7.81 |
| 44298.604166666664 | 9.38 |
| 44298.614583333336 | 6.38 |
| 44298.625 | 6.08 |
| 44298.635416666664 | 5.59 |
| 44298.645833333336 | 6.08 |
| 44298.65625 | 6.31 |
| 44298.666666666664 | 8.15 |
| 44298.677083333336 | 8.44 |
| 44298.6875 | 7.66 |
| 44298.697916666664 | 9.55 |
| 44298.708333333336 | 11.1 |
| 44298.71875 | 9.77 |
| 44298.729166666664 | 11.96 |
| 44298.739583333336 | 13.2 |
| 44298.75 | 13.4 |
| 44298.760416666664 | 14.85 |
| 44298.770833333336 | 14 |
| 44298.78125 | 15.51 |
| 44298.791666666664 | 13.69 |
| 44298.802083333336 | 13.89 |
| 44298.8125 | 13.36 |
| 44298.822916666664 | 14.58 |
| 44298.833333333336 | 12.95 |
| 44298.84375 | 10.46 |
| 44298.854166666664 | 9.91 |
| 44298.864583333336 | 9.17 |
| 44298.875 | 10.19 |
| 44298.885416666664 | 11.02 |
| 44298.895833333336 | 11.56 |
| 44298.90625 | 12.92 |
| 44298.916666666664 | 12.45 |
| 44298.927083333336 | 12.3 |
| 44298.9375 | 11.05 |
| 44298.947916666664 | 10.6 |
| 44298.958333333336 | 10.44 |
| 44298.96875 | 10.33 |
| 44298.979166666664 | 9.28 |
| 44298.989583333336 | 9.29 |
| 44299.0 | 8.18 |
| 44299.010416666664 | 8.89 |
| 44299.020833333336 | 7.7 |
| 44299.03125 | 8.28 |
| 44299.041666666664 | 8.09 |
| 44299.052083333336 | 7.4 |
| 44299.0625 | 7.26 |
| 44299.072916666664 | 6.93 |
| 44299.083333333336 | 6.92 |
| 44299.09375 | 6.9 |
| 44299.104166666664 | 6.95 |
| 44299.114583333336 | 6.77 |
| 44299.125 | 5.98 |
| 44299.135416666664 | 6.3 |
| 44299.145833333336 | 6.58 |
| 44299.15625 | 6.67 |
| 44299.166666666664 | 7.14 |
| 44299.177083333336 | 6.27 |
| 44299.1875 | 6.54 |
| 44299.197916666664 | 8.87 |
| 44299.208333333336 | 10.61 |
| 44299.21875 | 10.87 |
| 44299.229166666664 | 9.93 |
| 44299.239583333336 | 12.68 |
| 44299.25 | 17.13 |
| 44299.260416666664 | 14.41 |
| 44299.270833333336 | 18.14 |
| 44299.28125 | 22.59 |
| 44299.291666666664 | 20.65 |
| 44299.302083333336 | 22.19 |
| 44299.3125 | 22.92 |
| 44299.322916666664 | 21.31 |
| 44299.333333333336 | 17.81 |
| 44299.34375 | 16.5 |
| 44299.354166666664 | 12.58 |
| 44299.364583333336 | 11.7 |
| 44299.375 | 12.43 |
| 44299.385416666664 | 12.23 |
| 44299.395833333336 | 12.32 |
| 44299.40625 | 12.53 |
| 44299.416666666664 | 12.53 |
| 44299.427083333336 | 13.98 |
| 44299.4375 | 13.68 |
| 44299.447916666664 | 12.54 |
| 44299.458333333336 | 11.07 |
| 44299.46875 | 10.64 |
| 44299.479166666664 | 9.86 |
| 44299.489583333336 | 10.1 |
| 44299.5 | 9.33 |
| 44299.510416666664 | 8.67 |
| 44299.520833333336 | 8.51 |
| 44299.53125 | 8.13 |
| 44299.541666666664 | 8.14 |
| 44299.552083333336 | 7.98 |
| 44299.5625 | 7.97 |
| 44299.572916666664 | 7.88 |
| 44299.583333333336 | 7.79 |
| 44299.59375 | 7.48 |
| 44299.604166666664 | 7.56 |
| 44299.614583333336 | 7.2 |
| 44299.625 | 6.74 |
| 44299.635416666664 | 5.88 |
| 44299.645833333336 | 5.67 |
| 44299.65625 | 5.67 |
| 44299.666666666664 | 6.22 |
| 44299.677083333336 | 7.43 |
| 44299.6875 | 8.24 |
| 44299.697916666664 | 7.85 |
| 44299.708333333336 | 10.3 |
| 44299.71875 | 12.37 |
| 44299.729166666664 | 12.41 |
| 44299.739583333336 | 14.73 |
| 44299.75 | 13.29 |
| 44299.760416666664 | 15.01 |
| 44299.770833333336 | 13.95 |
| 44299.78125 | 15.24 |
| 44299.791666666664 | 14.16 |
| 44299.802083333336 | 14.08 |
| 44299.8125 | 14.04 |
| 44299.822916666664 | 12.89 |
| 44299.833333333336 | 10.95 |
| 44299.84375 | 10.26 |
| 44299.854166666664 | 9.93 |
| 44299.864583333336 | 9.34 |
| 44299.875 | 9.22 |
| 44299.885416666664 | 9.54 |
| 44299.895833333336 | 10.41 |
| 44299.90625 | 10.68 |
| 44299.916666666664 | 11.12 |
| 44299.927083333336 | 11.51 |
| 44299.9375 | 11.29 |
| 44299.947916666664 | 10.26 |
| 44299.958333333336 | 10.74 |
| 44299.96875 | 11.31 |
| 44299.979166666664 | 9.49 |
| 44299.989583333336 | 8.71 |
| 44300.0 | 7.81 |
| 44300.010416666664 | 7.2 |
| 44300.020833333336 | 6.96 |
| 44300.03125 | 6.12 |
| 44300.041666666664 | 6.16 |
| 44300.052083333336 | 6.13 |
| 44300.0625 | 5.7 |
| 44300.072916666664 | 5.23 |
| 44300.083333333336 | 5.06 |
| 44300.09375 | 5.13 |
| 44300.104166666664 | 5.42 |
| 44300.114583333336 | 5.03 |
| 44300.125 | 4.81 |
| 44300.135416666664 | 4.85 |
| 44300.145833333336 | 4.96 |
| 44300.15625 | 4.57 |
| 44300.166666666664 | 4.69 |
| 44300.177083333336 | 4.54 |
| 44300.1875 | 4.86 |
| 44300.197916666664 | 6.68 |
| 44300.208333333336 | 6.95 |
| 44300.21875 | 7.95 |
| 44300.229166666664 | 12.39 |
| 44300.239583333336 | 12.38 |
| 44300.25 | 15.48 |
| 44300.260416666664 | 17.07 |
| 44300.270833333336 | 19.74 |
| 44300.28125 | 19.39 |
| 44300.291666666664 | 18.65 |
| 44300.302083333336 | 19.22 |
| 44300.3125 | 21.03 |
| 44300.322916666664 | 19.53 |
| 44300.333333333336 | 17.24 |
| 44300.34375 | 16.01 |
| 44300.354166666664 | 13.26 |
| 44300.364583333336 | 11.51 |
| 44300.375 | 10.87 |
| 44300.385416666664 | 11.56 |
| 44300.395833333336 | 10.37 |
| 44300.40625 | 10.62 |
| 44300.416666666664 | 11.04 |
| 44300.427083333336 | 10.51 |
| 44300.4375 | 10.36 |
| 44300.447916666664 | 11.51 |
| 44300.458333333336 | 10.47 |
| 44300.46875 | 9.7 |
| 44300.479166666664 | 8.62 |
| 44300.489583333336 | 7.6 |
| 44300.5 | 7.71 |
| 44300.510416666664 | 7.83 |
| 44300.520833333336 | 7.65 |
| 44300.53125 | 7.19 |
| 44300.541666666664 | 7.18 |
| 44300.552083333336 | 6.8 |
| 44300.5625 | 6.94 |
| 44300.572916666664 | 7.09 |
| 44300.583333333336 | 6.85 |
| 44300.59375 | 6.18 |
| 44300.604166666664 | 6.22 |
| 44300.614583333336 | 6.58 |
| 44300.625 | 6.05 |
| 44300.635416666664 | 5.76 |
| 44300.645833333336 | 6.03 |
| 44300.65625 | 5.6 |
| 44300.666666666664 | 5.06 |
| 44300.677083333336 | 5.18 |
| 44300.6875 | 5.99 |
| 44300.697916666664 | 8.28 |
| 44300.708333333336 | 9.45 |
| 44300.71875 | 10.4 |
| 44300.729166666664 | 9.17 |
| 44300.739583333336 | 9.41 |
| 44300.75 | 9.79 |
| 44300.760416666664 | 11.87 |
| 44300.770833333336 | 12.15 |
| 44300.78125 | 12.33 |
| 44300.791666666664 | 12.87 |
| 44300.802083333336 | 12.91 |
| 44300.8125 | 11.12 |
| 44300.822916666664 | 11.06 |
| 44300.833333333336 | 10.58 |
| 44300.84375 | 10.49 |
| 44300.854166666664 | 10.1 |
| 44300.864583333336 | 10.36 |
| 44300.875 | 9.87 |
| 44300.885416666664 | 9.83 |
| 44300.895833333336 | 10.54 |
| 44300.90625 | 10.78 |
| 44300.916666666664 | 11.49 |
| 44300.927083333336 | 12.23 |
| 44300.9375 | 10.9 |
| 44300.947916666664 | 10.56 |
| 44300.958333333336 | 10.67 |
| 44300.96875 | 10.02 |
| 44300.979166666664 | 10 |
| 44300.989583333336 | 10.32 |
| 44301.0 | 10.33 |
| 44301.010416666664 | 9.76 |
| 44301.020833333336 | 9.08 |
| 44301.03125 | 9.1 |
| 44301.041666666664 | 8.44 |
| 44301.052083333336 | 7.32 |
| 44301.0625 | 6.75 |
| 44301.072916666664 | 6.87 |
| 44301.083333333336 | 6.48 |
| 44301.09375 | 6.29 |
| 44301.104166666664 | 5.8 |
| 44301.114583333336 | 5.88 |
| 44301.125 | 5.63 |
| 44301.135416666664 | 5.55 |
| 44301.145833333336 | 5.56 |
| 44301.15625 | 5.45 |
| 44301.166666666664 | 5.12 |
| 44301.177083333336 | 4.73 |
| 44301.1875 | 4.74 |
| 44301.197916666664 | 4.56 |
| 44301.208333333336 | 4.59 |
| 44301.21875 | 6.89 |
| 44301.229166666664 | 7.91 |
| 44301.239583333336 | 8.14 |
| 44301.25 | 7.97 |
| 44301.260416666664 | 9.1 |
| 44301.270833333336 | 11.46 |
| 44301.28125 | 10.27 |
| 44301.291666666664 | 19.88 |
| 44301.302083333336 | 14.98 |
| 44301.3125 | 13.78 |
| 44301.322916666664 | 14.65 |
| 44301.333333333336 | 14.95 |
| 44301.34375 | 14.06 |
| 44301.354166666664 | 13.3 |
| 44301.364583333336 | 12.59 |
| 44301.375 | 11.7 |
| 44301.385416666664 | 10.07 |
| 44301.395833333336 | 9.15 |
| 44301.40625 | 9.86 |
| 44301.416666666664 | 9.09 |
| 44301.427083333336 | 9.37 |
| 44301.4375 | 9.04 |
| 44301.447916666664 | 9.27 |
| 44301.458333333336 | 9.26 |
| 44301.46875 | 9.26 |
| 44301.479166666664 | 9.09 |
| 44301.489583333336 | 10.32 |
| 44301.5 | 10.36 |
| 44301.510416666664 | 10.36 |
| 44301.520833333336 | 10.63 |
| 44301.53125 | 9.42 |
| 44301.541666666664 | 9.22 |
| 44301.552083333336 | 8.76 |
| 44301.5625 | 8.09 |
| 44301.572916666664 | 7.25 |
| 44301.583333333336 | 7.14 |
| 44301.59375 | 6.84 |
| 44301.604166666664 | 6.16 |
| 44301.614583333336 | 6.13 |
| 44301.625 | 6.35 |
| 44301.635416666664 | 6.17 |
| 44301.645833333336 | 5.96 |
| 44301.65625 | 5.78 |
| 44301.666666666664 | 5.15 |
| 44301.677083333336 | 5.44 |
| 44301.6875 | 5.09 |
| 44301.697916666664 | 4.87 |
| 44301.708333333336 | 5.13 |
| 44301.71875 | 5.78 |
| 44301.729166666664 | 6.68 |
| 44301.739583333336 | 8.18 |
| 44301.75 | 8.3 |
| 44301.760416666664 | 8.29 |
| 44301.770833333336 | 9.5 |
| 44301.78125 | 8.57 |
| 44301.791666666664 | 10.16 |
| 44301.802083333336 | 11.08 |
| 44301.8125 | 10.6 |
| 44301.822916666664 | 11.4 |
| 44301.833333333336 | 10.02 |
| 44301.84375 | 9.51 |
| 44301.854166666664 | 8.87 |
| 44301.864583333336 | 8.94 |
| 44301.875 | 8.77 |
| 44301.885416666664 | 8.46 |
| 44301.895833333336 | 9.37 |
| 44301.90625 | 8.53 |
| 44301.916666666664 | 9.39 |
| 44301.927083333336 | 9.26 |
| 44301.9375 | 8.55 |
| 44301.947916666664 | 9.13 |
| 44301.958333333336 | 8.75 |
| 44301.96875 | 9.28 |
| 44301.979166666664 | 9.01 |
| 44301.989583333336 | 8.49 |
| 44302.0 | 8.17 |
| 44302.010416666664 | 8.49 |
| 44302.020833333336 | 7.73 |
| 44302.03125 | 7.38 |
| 44302.041666666664 | 6.81 |
| 44302.052083333336 | 6.4 |
| 44302.0625 | 6.34 |
| 44302.072916666664 | 5.82 |
| 44302.083333333336 | 6.04 |
| 44302.09375 | 5.63 |
| 44302.104166666664 | 5.59 |
| 44302.114583333336 | 5.5 |
| 44302.125 | 5.49 |
| 44302.135416666664 | 5.32 |
| 44302.145833333336 | 5.43 |
| 44302.15625 | 5.38 |
| 44302.166666666664 | 5.27 |
| 44302.177083333336 | 5.07 |
| 44302.1875 | 5.16 |
| 44302.197916666664 | 5.03 |
| 44302.208333333336 | 5.1 |
| 44302.21875 | 5.35 |
| 44302.229166666664 | 5.51 |
| 44302.239583333336 | 6.16 |
| 44302.25 | 6.06 |
| 44302.260416666664 | 7.2 |
| 44302.270833333336 | 10.35 |
| 44302.28125 | 11.58 |
| 44302.291666666664 | 9.66 |
| 44302.302083333336 | 10.81 |
| 44302.3125 | 8.65 |
| 44302.322916666664 | 9.51 |
| 44302.333333333336 | 11.85 |
| 44302.34375 | 11.88 |
| 44302.354166666664 | 11.76 |
| 44302.364583333336 | 10.83 |
| 44302.375 | 11.13 |
| 44302.385416666664 | 10.86 |
| 44302.395833333336 | 9.94 |
| 44302.40625 | 9.98 |
| 44302.416666666664 | 9.01 |
| 44302.427083333336 | 8.33 |
| 44302.4375 | 8.98 |
| 44302.447916666664 | 8.45 |
| 44302.458333333336 | 8.84 |
| 44302.46875 | 8.73 |
| 44302.479166666664 | 8.72 |
| 44302.489583333336 | 8.31 |
| 44302.5 | 8.18 |
| 44302.510416666664 | 8.3 |
| 44302.520833333336 | 7.51 |
| 44302.53125 | 7.77 |
| 44302.541666666664 | 6.66 |
| 44302.552083333336 | 6.75 |
| 44302.5625 | 5.99 |
| 44302.572916666664 | 6.51 |
| 44302.583333333336 | 6.14 |
| 44302.59375 | 6.33 |
| 44302.604166666664 | 5.92 |
| 44302.614583333336 | 6.56 |
| 44302.625 | 6.38 |
| 44302.635416666664 | 6.19 |
| 44302.645833333336 | 6.09 |
| 44302.65625 | 6.21 |
| 44302.666666666664 | 5.94 |
| 44302.677083333336 | 6.07 |
| 44302.6875 | 5.95 |
| 44302.697916666664 | 6.09 |
| 44302.708333333336 | 5.6 |
| 44302.71875 | 5.47 |
| 44302.729166666664 | 5.32 |
| 44302.739583333336 | 5.57 |
| 44302.75 | 6.52 |
| 44302.760416666664 | 7.1 |
| 44302.770833333336 | 6.94 |
| 44302.78125 | 6.91 |
| 44302.791666666664 | 7.42 |
| 44302.802083333336 | 7.18 |
| 44302.8125 | 7.82 |
| 44302.822916666664 | 7.99 |
| 44302.833333333336 | 7.7 |
| 44302.84375 | 8.27 |
| 44302.854166666664 | 8.61 |
| 44302.864583333336 | 8.41 |
| 44302.875 | 7.5 |
| 44302.885416666664 | 7.53 |
| 44302.895833333336 | 7.42 |
| 44302.90625 | 7.39 |
| 44302.916666666664 | 6.9 |
| 44302.927083333336 | 6.86 |
| 44302.9375 | 7.47 |
| 44302.947916666664 | 7.68 |
| 44302.958333333336 | 8.03 |
| 44302.96875 | 7.81 |
| 44302.979166666664 | 8.38 |
| 44302.989583333336 | 7.83 |
| 44303.0 | 8.18 |
| 44303.010416666664 | 8.02 |
| 44303.020833333336 | 7.15 |
| 44303.03125 | 7.32 |
| 44303.041666666664 | 6.44 |
| 44303.052083333336 | 6.23 |
| 44303.0625 | 5.79 |
| 44303.072916666664 | 5.56 |
| 44303.083333333336 | 5.48 |
| 44303.09375 | 5.59 |
| 44303.104166666664 | 4.99 |
| 44303.114583333336 | 5.34 |
| 44303.125 | 5.43 |
| 44303.135416666664 | 5.21 |
| 44303.145833333336 | 5.68 |
| 44303.15625 | 4.77 |
| 44303.166666666664 | 5.92 |
| 44303.177083333336 | 5.12 |
| 44303.1875 | 5.06 |
| 44303.197916666664 | 4.41 |
| 44303.208333333336 | 4.45 |
| 44303.21875 | 4.09 |
| 44303.229166666664 | 4.14 |
| 44303.239583333336 | 4.21 |
| 44303.25 | 5.42 |
| 44303.260416666664 | 5.03 |
| 44303.270833333336 | 5.53 |
| 44303.28125 | 6.74 |
| 44303.291666666664 | 7.79 |
| 44303.302083333336 | 7.95 |
| 44303.3125 | 8.89 |
| 44303.322916666664 | 7.62 |
| 44303.333333333336 | 9.61 |
| 44303.34375 | 10.88 |
| 44303.354166666664 | 12.17 |
| 44303.364583333336 | 11.77 |
| 44303.375 | 10.28 |
| 44303.385416666664 | 10.38 |
| 44303.395833333336 | 9.31 |
| 44303.40625 | 9.89 |
| 44303.416666666664 | 9 |
| 44303.427083333336 | 8.4 |
| 44303.4375 | 8.09 |
| 44303.447916666664 | 7.93 |
| 44303.458333333336 | 8.87 |
| 44303.46875 | 8.15 |
| 44303.479166666664 | 7.6 |
| 44303.489583333336 | 7.35 |
| 44303.5 | 8.01 |
| 44303.510416666664 | 8.41 |
| 44303.520833333336 | 7.99 |
| 44303.53125 | 8.26 |
| 44303.541666666664 | 8.29 |
| 44303.552083333336 | 7.94 |
| 44303.5625 | 7.5 |
| 44303.572916666664 | 6.99 |
| 44303.583333333336 | 7.11 |
| 44303.59375 | 6.96 |
| 44303.604166666664 | 6.64 |
| 44303.614583333336 | 6.49 |
| 44303.625 | 6.2 |
| 44303.635416666664 | 5.67 |
| 44303.645833333336 | 6.21 |
| 44303.65625 | 5.99 |
| 44303.666666666664 | 5.54 |
| 44303.677083333336 | 9.8 |
| 44303.6875 | 5.39 |
| 44303.697916666664 | 5.64 |
| 44303.708333333336 | 4.93 |
| 44303.71875 | 5.07 |
| 44303.729166666664 | 5.02 |
| 44303.739583333336 | 5.01 |
| 44303.75 | 4.78 |
| 44303.760416666664 | 5.26 |
| 44303.770833333336 | 6.14 |
| 44303.78125 | 6.44 |
| 44303.791666666664 | 6.92 |
| 44303.802083333336 | 7.13 |
| 44303.8125 | 6.54 |
| 44303.822916666664 | 7.63 |
| 44303.833333333336 | 7.66 |
| 44303.84375 | 7.62 |
| 44303.854166666664 | 7.54 |
| 44303.864583333336 | 7.9 |
| 44303.875 | 7.83 |
| 44303.885416666664 | 7.69 |
| 44303.895833333336 | 7.77 |
| 44303.90625 | 7.41 |
| 44303.916666666664 | 7.11 |
| 44303.927083333336 | 7.19 |
| 44303.9375 | 7.03 |
| 44303.947916666664 | 6.67 |
| 44303.958333333336 | 8.23 |
| 44303.96875 | 8.23 |
| 44303.979166666664 | 8.42 |
| 44303.989583333336 | 8.15 |
| 44304.0 | 8.9 |
| 44304.010416666664 | 14.54 |
| 44304.020833333336 | 7.87 |
| 44304.03125 | 8.28 |
| 44304.041666666664 | 7.78 |
| 44304.052083333336 | 7.08 |
| 44304.0625 | 6.66 |
| 44304.072916666664 | 6.35 |
| 44304.083333333336 | 6.56 |
| 44304.09375 | 6.74 |
| 44304.104166666664 | 5.96 |
| 44304.114583333336 | 5.74 |
| 44304.125 | 5.44 |
| 44304.135416666664 | 5.38 |
| 44304.145833333336 | 5.31 |
| 44304.15625 | 5.17 |
| 44304.166666666664 | 5.06 |
| 44304.177083333336 | 5.15 |
| 44304.1875 | 4.76 |
| 44304.197916666664 | 4.87 |
| 44304.208333333336 | 4.91 |
| 44304.21875 | 4.42 |
| 44304.229166666664 | 4.26 |
| 44304.239583333336 | 4.4 |
| 44304.25 | 4.15 |
| 44304.260416666664 | 4.32 |
| 44304.270833333336 | 3.87 |
| 44304.28125 | 4.3 |
| 44304.291666666664 | 4.1 |
| 44304.302083333336 | 5.26 |
| 44304.3125 | 5.22 |
| 44304.322916666664 | 6.54 |
| 44304.333333333336 | 6.33 |
| 44304.34375 | 7.69 |
| 44304.354166666664 | 7.43 |
| 44304.364583333336 | 8.19 |
| 44304.375 | 8.54 |
| 44304.385416666664 | 8.37 |
| 44304.395833333336 | 8.45 |
| 44304.40625 | 8.55 |
| 44304.416666666664 | 8.86 |
| 44304.427083333336 | 8.52 |
| 44304.4375 | 8.07 |
| 44304.447916666664 | 7.83 |
| 44304.458333333336 | 7.77 |
| 44304.46875 | 7.29 |
| 44304.479166666664 | 7.5 |
| 44304.489583333336 | 6.88 |
| 44304.5 | 6.45 |
| 44304.510416666664 | 6.9 |
| 44304.520833333336 | 7.67 |
| 44304.53125 | 7.47 |
| 44304.541666666664 | 7.97 |
| 44304.552083333336 | 8.3 |
| 44304.5625 | 7.86 |
| 44304.572916666664 | 7.96 |
| 44304.583333333336 | 7.72 |
| 44304.59375 | 7.08 |
| 44304.604166666664 | 6.79 |
| 44304.614583333336 | 6.22 |
| 44304.625 | 5.9 |
| 44304.635416666664 | 5.66 |
| 44304.645833333336 | 5.67 |
| 44304.65625 | 5.33 |
| 44304.666666666664 | 5.29 |
| 44304.677083333336 | 5.27 |
| 44304.6875 | 5.14 |
| 44304.697916666664 | 4.69 |
| 44304.708333333336 | 4.98 |
| 44304.71875 | 4.98 |
| 44304.729166666664 | 5.45 |
| 44304.739583333336 | 6.06 |
| 44304.75 | 5.17 |
| 44304.760416666664 | 4.52 |
| 44304.770833333336 | 4.73 |
| 44304.78125 | 4.92 |
| 44304.791666666664 | 5.79 |
| 44304.802083333336 | 7.02 |
| 44304.8125 | 6.86 |
| 44304.822916666664 | 7.77 |
| 44304.833333333336 | 8.3 |
| 44304.84375 | 8.32 |
| 44304.854166666664 | 8.19 |
| 44304.864583333336 | 7.79 |
| 44304.875 | 8.09 |
| 44304.885416666664 | 7.83 |
| 44304.895833333336 | 7.35 |
| 44304.90625 | 7.04 |
| 44304.916666666664 | 6.8 |
| 44304.927083333336 | 7.06 |
| 44304.9375 | 7.3 |
| 44304.947916666664 | 7.02 |
| 44304.958333333336 | 7.71 |
| 44304.96875 | 7.09 |
| 44304.979166666664 | 7.2 |
| 44304.989583333336 | 7.19 |
| 44305.0 | 6.94 |
| 44305.010416666664 | 7.51 |
| 44305.020833333336 | 7.6 |
| 44305.03125 | 7.63 |
| 44305.041666666664 | 7.32 |
| 44305.052083333336 | 8.21 |
| 44305.0625 | 8.75 |
| 44305.072916666664 | 8.11 |
| 44305.083333333336 | 7.51 |
| 44305.09375 | 6.89 |
| 44305.104166666664 | 7.44 |
| 44305.114583333336 | 7.36 |
| 44305.125 | 6.84 |
| 44305.135416666664 | 6.58 |
| 44305.145833333336 | 6.21 |
| 44305.15625 | 6.46 |
| 44305.166666666664 | 5.14 |
| 44305.177083333336 | 5.66 |
| 44305.1875 | 5.42 |
| 44305.197916666664 | 5.26 |
| 44305.208333333336 | 4.9 |
| 44305.21875 | 4.84 |
| 44305.229166666664 | 4.97 |
| 44305.239583333336 | 4.34 |
| 44305.25 | 4.11 |
| 44305.260416666664 | 4.29 |
| 44305.270833333336 | 4.35 |
| 44305.28125 | 4.58 |
| 44305.291666666664 | 4.09 |
| 44305.302083333336 | 4.45 |
| 44305.3125 | 4.67 |
| 44305.322916666664 | 6.18 |
| 44305.333333333336 | 5.62 |
| 44305.34375 | 6.23 |
| 44305.354166666664 | 8.04 |
| 44305.364583333336 | 7.48 |
| 44305.375 | 7.23 |
| 44305.385416666664 | 7.26 |
| 44305.395833333336 | 7.58 |
| 44305.40625 | 7.29 |
| 44305.416666666664 | 6.82 |
| 44305.427083333336 | 7.5 |
| 44305.4375 | 8.38 |
| 44305.447916666664 | 8.02 |
| 44305.458333333336 | 8.39 |
| 44305.46875 | 8.72 |
| 44305.479166666664 | 9.07 |
| 44305.489583333336 | 8.17 |
| 44305.5 | 8.23 |
| 44305.510416666664 | 8 |
| 44305.520833333336 | 7.82 |
| 44305.53125 | 7.55 |
| 44305.541666666664 | 7.91 |
| 44305.552083333336 | 7.59 |
| 44305.5625 | 8.25 |
| 44305.572916666664 | 8.31 |
| 44305.583333333336 | 8.73 |
| 44305.59375 | 8.57 |
| 44305.604166666664 | 9.03 |
| 44305.614583333336 | 8.13 |
| 44305.625 | 7.37 |
| 44305.635416666664 | 6.83 |
| 44305.645833333336 | 6.44 |
| 44305.65625 | 6.81 |
| 44305.666666666664 | 6.15 |
| 44305.677083333336 | 5.98 |
| 44305.6875 | 5.43 |
| 44305.697916666664 | 5.44 |
| 44305.708333333336 | 5.5 |
| 44305.71875 | 5.39 |
| 44305.729166666664 | 5.61 |
| 44305.739583333336 | 5.64 |
| 44305.75 | 5.24 |
| 44305.760416666664 | 5.1 |
| 44305.770833333336 | 4.49 |
| 44305.78125 | 5.09 |
| 44305.791666666664 | 4.79 |
| 44305.802083333336 | 4.84 |
| 44305.8125 | 5.22 |
| 44305.822916666664 | 5.86 |
| 44305.833333333336 | 5.69 |
| 44305.84375 | 5.84 |
| 44305.854166666664 | 7.02 |
| 44305.864583333336 | 7.64 |
| 44305.875 | 8.13 |
| 44305.885416666664 | 8.26 |
| 44305.895833333336 | 9.33 |
| 44305.90625 | 10.89 |
| 44305.916666666664 | 11.68 |
| 44305.927083333336 | 12 |
| 44305.9375 | 12.1 |
| 44305.947916666664 | 10.89 |
| 44305.958333333336 | 10.6 |
| 44305.96875 | 10.6 |
| 44305.979166666664 | 9.46 |
| 44305.989583333336 | 9.43 |
| 44306.0 | 8.8 |
| 44306.010416666664 | 8.61 |
| 44306.020833333336 | 8.5 |
| 44306.03125 | 8.94 |
| 44306.041666666664 | 9.03 |
| 44306.052083333336 | 9.18 |
| 44306.0625 | 8.32 |
| 44306.072916666664 | 8.25 |
| 44306.083333333336 | 7.98 |
| 44306.09375 | 7.73 |
| 44306.104166666664 | 6.8 |
| 44306.114583333336 | 6.77 |
| 44306.125 | 5.97 |
| 44306.135416666664 | 5.85 |
| 44306.145833333336 | 5.89 |
| 44306.15625 | 6.18 |
| 44306.166666666664 | 5.63 |
| 44306.177083333336 | 5.77 |
| 44306.1875 | 5.58 |
| 44306.197916666664 | 5.47 |
| 44306.208333333336 | 4.91 |
| 44306.21875 | 5 |
| 44306.229166666664 | 4.9 |
| 44306.239583333336 | 4.57 |
| 44306.25 | 4.91 |
| 44306.260416666664 | 4.45 |
| 44306.270833333336 | 4.54 |
| 44306.28125 | 4.58 |
| 44306.291666666664 | 4.46 |
| 44306.302083333336 | 4.65 |
| 44306.3125 | 4.36 |
| 44306.322916666664 | 4.59 |
| 44306.333333333336 | 4.61 |
| 44306.34375 | 4.23 |
| 44306.354166666664 | 5.46 |
| 44306.364583333336 | 5.54 |
| 44306.375 | 6.13 |
| 44306.385416666664 | 7.4 |
| 44306.395833333336 | 8.7 |
| 44306.40625 | 8.7 |
| 44306.416666666664 | 8.95 |
| 44306.427083333336 | 10.41 |
| 44306.4375 | 12.04 |
| 44306.447916666664 | 13.11 |
| 44306.458333333336 | 13.06 |
| 44306.46875 | 13.68 |
| 44306.479166666664 | 13.22 |
| 44306.489583333336 | 11.89 |
| 44306.5 | 10.79 |
| 44306.510416666664 | 10.15 |
| 44306.520833333336 | 10.18 |
| 44306.53125 | 8.79 |
| 44306.541666666664 | 7.43 |
| 44306.552083333336 | 8.98 |
| 44306.5625 | 8.58 |
| 44306.572916666664 | 8.88 |
| 44306.583333333336 | 9.2 |
| 44306.59375 | 8.6 |
| 44306.604166666664 | 8.91 |
| 44306.614583333336 | 8.37 |
| 44306.625 | 8.36 |
| 44306.635416666664 | 8.69 |
| 44306.645833333336 | 9.23 |
| 44306.65625 | 9.07 |
| 44306.666666666664 | 8.15 |
| 44306.677083333336 | 8.49 |
| 44306.6875 | 8.17 |
| 44306.697916666664 | 7.82 |
| 44306.708333333336 | 7.63 |
| 44306.71875 | 7.17 |
| 44306.729166666664 | 7.66 |
| 44306.739583333336 | 7.18 |
| 44306.75 | 6.87 |
| 44306.760416666664 | 6.44 |
| 44306.770833333336 | 6.83 |
| 44306.78125 | 6.35 |
| 44306.791666666664 | 6.22 |
| 44306.802083333336 | 6.64 |
| 44306.8125 | 6.11 |
| 44306.822916666664 | 5.62 |
| 44306.833333333336 | 6.12 |
| 44306.84375 | 7.41 |
| 44306.854166666664 | 6.85 |
| 44306.864583333336 | 6.85 |
| 44306.875 | 6.92 |
| 44306.885416666664 | 7.16 |
| 44306.895833333336 | 8.34 |
| 44306.90625 | 9.17 |
| 44306.916666666664 | 9.76 |
| 44306.927083333336 | 15.44 |
| 44306.9375 | 18.95 |
| 44306.947916666664 | 25.51 |
| 44306.958333333336 | 25.85 |
| 44306.96875 | 18.58 |
| 44306.979166666664 | 13.81 |
| 44306.989583333336 | 12.1 |
| 44307.0 | 11.72 |
| 44307.010416666664 | 12.33 |
| 44307.020833333336 | 11.78 |
| 44307.03125 | 11.5 |
| 44307.041666666664 | 10.88 |
| 44307.052083333336 | 9.95 |
| 44307.0625 | 9.31 |
| 44307.072916666664 | 9.15 |
| 44307.083333333336 | 9.54 |
| 44307.09375 | 10.26 |
| 44307.104166666664 | 9.17 |
| 44307.114583333336 | 9.77 |
| 44307.125 | 13.36 |
| 44307.135416666664 | 16.26 |
| 44307.145833333336 | 17.24 |
| 44307.15625 | 18.21 |
| 44307.166666666664 | 19.84 |
| 44307.177083333336 | 22.66 |
| 44307.1875 | 23.65 |
| 44307.197916666664 | 24.6 |
| 44307.208333333336 | 30.69 |
| 44307.21875 | 25.48 |
| 44307.229166666664 | 25.43 |
| 44307.239583333336 | 25.12 |
| 44307.25 | 18.37 |
| 44307.260416666664 | 22.22 |
| 44307.270833333336 | 20.81 |
| 44307.28125 | 18.23 |
| 44307.291666666664 | 16.11 |
| 44307.302083333336 | 15.39 |
| 44307.3125 | 16.68 |
| 44307.322916666664 | 53.25 |
| 44307.333333333336 | 9.89 |
| 44307.34375 | 12.91 |
| 44307.354166666664 | 11.35 |
| 44307.364583333336 | 9.39 |
| 44307.375 | 9.52 |
| 44307.385416666664 | 9.51 |
| 44307.395833333336 | 8.83 |
| 44307.40625 | 8.92 |
| 44307.416666666664 | 12.29 |
| 44307.427083333336 | 10.74 |
| 44307.4375 | 10.19 |
| 44307.447916666664 | 10.86 |
| 44307.458333333336 | 11.37 |
| 44307.46875 | 11.64 |
| 44307.479166666664 | 12.4 |
| 44307.489583333336 | 12.42 |
| 44307.5 | 11.3 |
| 44307.510416666664 | 11.65 |
| 44307.520833333336 | 11.02 |
| 44307.53125 | 11.18 |
| 44307.541666666664 | 12.2 |
| 44307.552083333336 | 10.88 |
| 44307.5625 | 10.71 |
| 44307.572916666664 | 10.84 |
| 44307.583333333336 | 9.95 |
| 44307.59375 | 10.34 |
| 44307.604166666664 | 10.61 |
| 44307.614583333336 | 11.74 |
| 44307.625 | 11.94 |
| 44307.635416666664 | 13 |
| 44307.645833333336 | 13.17 |
| 44307.65625 | 13.19 |
| 44307.666666666664 | 14.26 |
| 44307.677083333336 | 13.84 |
| 44307.6875 | 14.51 |
| 44307.697916666664 | 12.91 |
| 44307.708333333336 | 14.61 |
| 44307.71875 | 13.58 |
| 44307.729166666664 | 14.56 |
| 44307.739583333336 | 15.84 |
| 44307.75 | 12.85 |
| 44307.760416666664 | 14.64 |
| 44307.770833333336 | 16.04 |
| 44307.78125 | 14.27 |
| 44307.791666666664 | 15.64 |
| 44307.802083333336 | 12.42 |
| 44307.8125 | 8.32 |
| 44307.822916666664 | 9.29 |
| 44307.833333333336 | 11.2 |
| 44307.84375 | 10.69 |
| 44307.854166666664 | 9.66 |
| 44307.864583333336 | 8.26 |
| 44307.875 | 8.99 |
| 44307.885416666664 | 9.33 |
| 44307.895833333336 | 9.16 |
| 44307.90625 | 10.54 |
| 44307.916666666664 | 11.54 |
| 44307.927083333336 | 11.86 |
| 44307.9375 | 11.94 |
| 44307.947916666664 | 12.97 |
| 44307.958333333336 | 14.62 |
| 44307.96875 | 16.3 |
| 44307.979166666664 | 20.14 |
| 44307.989583333336 | 19.28 |
| 44308.0 | 17.75 |
| 44308.010416666664 | 16.83 |
| 44308.020833333336 | 16.57 |
| 44308.03125 | 16.68 |
| 44308.041666666664 | 18.16 |
| 44308.052083333336 | 18.93 |
| 44308.0625 | 18.04 |
| 44308.072916666664 | 18.49 |
| 44308.083333333336 | 18.47 |
| 44308.09375 | 16.15 |
| 44308.104166666664 | 16.28 |
| 44308.114583333336 | 16.65 |
| 44308.125 | 14.77 |
| 44308.135416666664 | 15.9 |
| 44308.145833333336 | 15.52 |
| 44308.15625 | 13.9 |
| 44308.166666666664 | 14.03 |
| 44308.177083333336 | 21.2 |
| 44308.1875 | 17.15 |
| 44308.197916666664 | 21.76 |
| 44308.208333333336 | 22.72 |
| 44308.21875 | 22.89 |
| 44308.229166666664 | 19.82 |
| 44308.239583333336 | 17.27 |
| 44308.25 | 18.54 |
| 44308.260416666664 | 15.73 |
| 44308.270833333336 | 14.24 |
| 44308.28125 | 17.32 |
| 44308.291666666664 | 17.03 |
| 44308.302083333336 | 20.25 |
| 44308.3125 | 28.22 |
| 44308.322916666664 | 19.89 |
| 44308.333333333336 | 20.69 |
| 44308.34375 | 20.02 |
| 44308.354166666664 | 18.55 |
| 44308.364583333336 | 17.54 |
| 44308.375 | 12.44 |
| 44308.385416666664 | 14.68 |
| 44308.395833333336 | 11.42 |
| 44308.40625 | 11.02 |
| 44308.416666666664 | 13.65 |
| 44308.427083333336 | 11.17 |
| 44308.4375 | 13.53 |
| 44308.447916666664 | 15.09 |
| 44308.458333333336 | 12.03 |
| 44308.46875 | 11.86 |
| 44308.479166666664 | 10.32 |
| 44308.489583333336 | 10.15 |
| 44308.5 | 9.65 |
| 44308.510416666664 | 10 |
| 44308.520833333336 | 9.64 |
| 44308.53125 | 10.22 |
| 44308.541666666664 | 9.77 |
| 44308.552083333336 | 9.71 |
| 44308.5625 | 10.34 |
| 44308.572916666664 | 10.87 |
| 44308.583333333336 | 11.47 |
| 44308.59375 | 12.62 |
| 44308.604166666664 | 14.11 |
| 44308.614583333336 | 11.64 |
| 44308.625 | 13.32 |
| 44308.635416666664 | 14.03 |
| 44308.645833333336 | 12.82 |
| 44308.65625 | 12.94 |
| 44308.666666666664 | 18.21 |
| 44308.677083333336 | 28.62 |
| 44308.6875 | 12.02 |
| 44308.697916666664 | 13.3 |
| 44308.708333333336 | 115.01 |
| 44308.71875 | 18.87 |
| 44308.729166666664 | 18.83 |
| 44308.739583333336 | 54.69 |
| 44308.75 | 13.5 |
| 44308.760416666664 | 14.72 |
| 44308.770833333336 | 12.18 |
| 44308.78125 | 11.94 |
| 44308.791666666664 | 13.26 |
| 44308.802083333336 | 47.06 |
| 44308.8125 | 12.22 |
| 44308.822916666664 | 13.17 |
| 44308.833333333336 | 11.64 |
| 44308.84375 | 10.32 |
| 44308.854166666664 | 11.12 |
| 44308.864583333336 | 11.55 |
| 44308.875 | 11.41 |
| 44308.885416666664 | 11.42 |
| 44308.895833333336 | 9.49 |
| 44308.90625 | 7.86 |
| 44308.916666666664 | 7.6 |
| 44308.927083333336 | 8.14 |
| 44308.9375 | 8.57 |
| 44308.947916666664 | 8.35 |
| 44308.958333333336 | 8.99 |
| 44308.96875 | 8.78 |
| 44308.979166666664 | 9.47 |
| 44308.989583333336 | 10.31 |
| 44309.0 | 10.27 |
| 44309.010416666664 | 11.94 |
| 44309.020833333336 | 12.87 |
| 44309.03125 | 11.74 |
| 44309.041666666664 | 11.07 |
| 44309.052083333336 | 10.32 |
| 44309.0625 | 9.8 |
| 44309.072916666664 | 10.65 |
| 44309.083333333336 | 10.37 |
| 44309.09375 | 10.45 |
| 44309.104166666664 | 15.04 |
| 44309.114583333336 | 11.92 |
| 44309.125 | 13.31 |
| 44309.135416666664 | 10.75 |
| 44309.145833333336 | 11.29 |
| 44309.15625 | 9.37 |
| 44309.166666666664 | 10.02 |
| 44309.177083333336 | 9.95 |
| 44309.1875 | 10.49 |
| 44309.197916666664 | 10.18 |
| 44309.208333333336 | 10.64 |
| 44309.21875 | 11.24 |
| 44309.229166666664 | 10.07 |
| 44309.239583333336 | 11.96 |
| 44309.25 | 11.28 |
| 44309.260416666664 | 10.34 |
| 44309.270833333336 | 10.02 |
| 44309.28125 | 9.51 |
| 44309.291666666664 | 10.84 |
| 44309.302083333336 | 10.51 |
| 44309.3125 | 10.42 |
| 44309.322916666664 | 9.12 |
| 44309.333333333336 | 9.97 |
| 44309.34375 | 8.47 |
| 44309.354166666664 | 8.86 |
| 44309.364583333336 | 8.66 |
| 44309.375 | 10.62 |
| 44309.385416666664 | 8.51 |
| 44309.395833333336 | 8.27 |
| 44309.40625 | 8.06 |
| 44309.416666666664 | 6.24 |
| 44309.427083333336 | 5.14 |
| 44309.4375 | 5.52 |
| 44309.447916666664 | 5.76 |
| 44309.458333333336 | 6.03 |
| 44309.46875 | 6.94 |
| 44309.479166666664 | 6.81 |
| 44309.489583333336 | 7.15 |
| 44309.5 | 7.32 |
| 44309.510416666664 | 7.97 |
| 44309.520833333336 | 10.33 |
| 44309.53125 | 10.62 |
| 44309.541666666664 | 10.83 |
| 44309.552083333336 | 10.21 |
| 44309.5625 | 10.27 |
| 44309.572916666664 | 9.49 |
| 44309.583333333336 | 22.53 |
| 44309.59375 | 9.15 |
| 44309.604166666664 | 17.43 |
| 44309.614583333336 | 10.9 |
| 44309.625 | 19.2 |
| 44309.635416666664 | 14.41 |
| 44309.645833333336 | 23.21 |
| 44309.65625 | 20.26 |
| 44309.666666666664 | 20.9 |
| 44309.677083333336 | 12.16 |
| 44309.6875 | 11.63 |
| 44309.697916666664 | 13.77 |
| 44309.708333333336 | 11.61 |
| 44309.71875 | 12.27 |
| 44309.729166666664 | 12.37 |
| 44309.739583333336 | 13.19 |
| 44309.75 | 14.54 |
| 44309.760416666664 | 17.07 |
| 44309.770833333336 | 16.93 |
| 44309.78125 | 17.07 |
| 44309.791666666664 | 17.96 |
| 44309.802083333336 | 20.19 |
| 44309.8125 | 17.72 |
| 44309.822916666664 | 15.78 |
| 44309.833333333336 | 16.66 |
| 44309.84375 | 16.91 |
| 44309.854166666664 | 17.62 |
| 44309.864583333336 | 16.83 |
| 44309.875 | 15.95 |
| 44309.885416666664 | 15.33 |
| 44309.895833333336 | 13.4 |
| 44309.90625 | 12.04 |
| 44309.916666666664 | 11 |
| 44309.927083333336 | 10.32 |
| 44309.9375 | 9.54 |
| 44309.947916666664 | 8.99 |
| 44309.958333333336 | 8.65 |
| 44309.96875 | 8.54 |
| 44309.979166666664 | 7.8 |
| 44309.989583333336 | 7.99 |
| 44310.0 | 10.31 |
| 44310.010416666664 | 11.58 |
| 44310.020833333336 | 13.12 |
| 44310.03125 | 14.51 |
| 44310.041666666664 | 16.19 |
| 44310.052083333336 | 18.76 |
| 44310.0625 | 19.2 |
| 44310.072916666664 | 18.94 |
| 44310.083333333336 | 17.37 |
| 44310.09375 | 16.72 |
| 44310.104166666664 | 16.21 |
| 44310.114583333336 | 14.44 |
| 44310.125 | 13.32 |
| 44310.135416666664 | 15.15 |
| 44310.145833333336 | 15.68 |
| 44310.15625 | 14.86 |
| 44310.166666666664 | 12.72 |
| 44310.177083333336 | 12.31 |
| 44310.1875 | 13.65 |
| 44310.197916666664 | 12.93 |
| 44310.208333333336 | 11.26 |
| 44310.21875 | 11.72 |
| 44310.229166666664 | 10.42 |
| 44310.239583333336 | 10.03 |
| 44310.25 | 9.84 |
| 44310.260416666664 | 10.48 |
| 44310.270833333336 | 10.9 |
| 44310.28125 | 11.29 |
| 44310.291666666664 | 11.4 |
| 44310.302083333336 | 15.91 |
| 44310.3125 | 12.63 |
| 44310.322916666664 | 11.5 |
| 44310.333333333336 | 10.15 |
| 44310.34375 | 9.31 |
| 44310.354166666664 | 8.61 |
| 44310.364583333336 | 8.14 |
| 44310.375 | 8.01 |
| 44310.385416666664 | 8.1 |
| 44310.395833333336 | 8.53 |
| 44310.40625 | 8.08 |
| 44310.416666666664 | 8.04 |
| 44310.427083333336 | 7.85 |
| 44310.4375 | 7.66 |
| 44310.447916666664 | 7.84 |
| 44310.458333333336 | 5.85 |
| 44310.46875 | 6.12 |
| 44310.479166666664 | 5.91 |
| 44310.489583333336 | 6.25 |
| 44310.5 | 6.18 |
| 44310.510416666664 | 6 |
| 44310.520833333336 | 7.55 |
| 44310.53125 | 7.81 |
| 44310.541666666664 | 8.29 |
| 44310.552083333336 | 8.76 |
| 44310.5625 | 9.71 |
| 44310.572916666664 | 10.29 |
| 44310.583333333336 | 11.77 |
| 44310.59375 | 10.9 |
| 44310.604166666664 | 10.71 |
| 44310.614583333336 | 10.82 |
| 44310.625 | 10.76 |
| 44310.635416666664 | 10.58 |
| 44310.645833333336 | 11.05 |
| 44310.65625 | 10.27 |
| 44310.666666666664 | 10.9 |
| 44310.677083333336 | 10.22 |
| 44310.6875 | 11.36 |
| 44310.697916666664 | 10.63 |
| 44310.708333333336 | 9.79 |
| 44310.71875 | 13.05 |
| 44310.729166666664 | 12.32 |
| 44310.739583333336 | 14.71 |
| 44310.75 | 15.24 |
| 44310.760416666664 | 17.63 |
| 44310.770833333336 | 14.17 |
| 44310.78125 | 15.79 |
| 44310.791666666664 | 15.43 |
| 44310.802083333336 | 15.69 |
| 44310.8125 | 15.4 |
| 44310.822916666664 | 17.37 |
| 44310.833333333336 | 18.53 |
| 44310.84375 | 16.48 |
| 44310.854166666664 | 16.58 |
| 44310.864583333336 | 17.71 |
| 44310.875 | 15.46 |
| 44310.885416666664 | 15.24 |
| 44310.895833333336 | 12.72 |
| 44310.90625 | 13.59 |
| 44310.916666666664 | 12.57 |
| 44310.927083333336 | 12.15 |
| 44310.9375 | 11.41 |
| 44310.947916666664 | 10.19 |
| 44310.958333333336 | 10.34 |
| 44310.96875 | 9.24 |
| 44310.979166666664 | 8.99 |
| 44310.989583333336 | 8.09 |
| 44311.0 | 7.6 |
| 44311.010416666664 | 7.13 |
| 44311.020833333336 | 7.28 |
| 44311.03125 | 8.92 |
| 44311.041666666664 | 8.68 |
| 44311.052083333336 | 11.14 |
| 44311.0625 | 11.91 |
| 44311.072916666664 | 11.76 |
| 44311.083333333336 | 12 |
| 44311.09375 | 13.71 |
| 44311.104166666664 | 14.05 |
| 44311.114583333336 | 17.3 |
| 44311.125 | 18.72 |
| 44311.135416666664 | 20.16 |
| 44311.145833333336 | 20.93 |
| 44311.15625 | 25 |
| 44311.166666666664 | 26.29 |
| 44311.177083333336 | 29.24 |
| 44311.1875 | 32.97 |
| 44311.197916666664 | 31.52 |
| 44311.208333333336 | 24.28 |
| 44311.21875 | 21.95 |
| 44311.229166666664 | 17.74 |
| 44311.239583333336 | 20.05 |
| 44311.25 | 19.34 |
| 44311.260416666664 | 17.41 |
| 44311.270833333336 | 20.21 |
| 44311.28125 | 16.56 |
| 44311.291666666664 | 15.16 |
| 44311.302083333336 | 19.14 |
| 44311.3125 | 17.8 |
| 44311.322916666664 | 20.24 |
| 44311.333333333336 | 21 |
| 44311.34375 | 22.09 |
| 44311.354166666664 | 24.67 |
| 44311.364583333336 | 25.05 |
| 44311.375 | 25.29 |
| 44311.385416666664 | 22.59 |
| 44311.395833333336 | 20.8 |
| 44311.40625 | 19.11 |
| 44311.416666666664 | 15.61 |
| 44311.427083333336 | 18.04 |
| 44311.4375 | 16.76 |
| 44311.447916666664 | 16.24 |
| 44311.458333333336 | 15.51 |
| 44311.46875 | 15.51 |
| 44311.479166666664 | 13.21 |
| 44311.489583333336 | 13.09 |
| 44311.5 | 12.01 |
| 44311.510416666664 | 11.05 |
| 44311.520833333336 | 9.95 |
| 44311.53125 | 9.53 |
| 44311.541666666664 | 10.22 |
| 44311.552083333336 | 10.24 |
| 44311.5625 | 11.68 |
| 44311.572916666664 | 14.38 |
| 44311.583333333336 | 15.1 |
| 44311.59375 | 22.11 |
| 44311.604166666664 | 21.69 |
| 44311.614583333336 | 25.53 |
| 44311.625 | 32.51 |
| 44311.635416666664 | 29.96 |
| 44311.645833333336 | 29.88 |
| 44311.65625 | 26.52 |
| 44311.666666666664 | 24.89 |
| 44311.677083333336 | 24.04 |
| 44311.6875 | 22.03 |
| 44311.697916666664 | 22.08 |
| 44311.708333333336 | 18.78 |
| 44311.71875 | 17.53 |
| 44311.729166666664 | 17.96 |
| 44311.739583333336 | 15.07 |
| 44311.75 | 17.83 |
| 44311.760416666664 | 13.3 |
| 44311.770833333336 | 14.43 |
| 44311.78125 | 14.4 |
| 44311.791666666664 | 16.56 |
| 44311.802083333336 | 21.96 |
| 44311.8125 | 21.92 |
| 44311.822916666664 | 21.32 |
| 44311.833333333336 | 22.32 |
| 44311.84375 | 19.76 |
| 44311.854166666664 | 14.35 |
| 44311.864583333336 | 20.57 |
| 44311.875 | 21.71 |
| 44311.885416666664 | 24.34 |
| 44311.895833333336 | 24.88 |
| 44311.90625 | 18.92 |
| 44311.916666666664 | 21.61 |
| 44311.927083333336 | 19.59 |
| 44311.9375 | 18.58 |
| 44311.947916666664 | 16.51 |
| 44311.958333333336 | 15.47 |
| 44311.96875 | 15.05 |
| 44311.979166666664 | 14.04 |
| 44311.989583333336 | 13.18 |
| 44312.0 | 12.37 |
| 44312.010416666664 | 11.98 |
| 44312.020833333336 | 11.87 |
| 44312.03125 | 11.02 |
| 44312.041666666664 | 8.47 |
| 44312.052083333336 | 8.75 |
| 44312.0625 | 8.85 |
| 44312.072916666664 | 8.21 |
| 44312.083333333336 | 9.74 |
| 44312.09375 | 9.75 |
| 44312.104166666664 | 9.7 |
| 44312.114583333336 | 15.16 |
| 44312.125 | 17.25 |
| 44312.135416666664 | 23.22 |
| 44312.145833333336 | 19.59 |
| 44312.15625 | 22.99 |
| 44312.166666666664 | 24.11 |
| 44312.177083333336 | 25.18 |
| 44312.1875 | 28.54 |
| 44312.197916666664 | 35.09 |
| 44312.208333333336 | 38.35 |
| 44312.21875 | 38.33 |
| 44312.229166666664 | 36.54 |
| 44312.239583333336 | 30.4 |
| 44312.25 | 28.97 |
| 44312.260416666664 | 23.25 |
| 44312.270833333336 | 22.36 |
| 44312.28125 | 17.68 |
| 44312.291666666664 | 17.57 |
| 44312.302083333336 | 14.42 |
| 44312.3125 | 16.22 |
| 44312.322916666664 | 14.75 |
| 44312.333333333336 | 15.73 |
| 44312.34375 | 20.31 |
| 44312.354166666664 | 21.62 |
| 44312.364583333336 | 18.45 |
| 44312.375 | 16.56 |
| 44312.385416666664 | 15.44 |
| 44312.395833333336 | 15.2 |
| 44312.40625 | 15.57 |
| 44312.416666666664 | 15.49 |
| 44312.427083333336 | 16.23 |
| 44312.4375 | 16.71 |
| 44312.447916666664 | 15.62 |
| 44312.458333333336 | 14.58 |
| 44312.46875 | 14.55 |
| 44312.479166666664 | 13.61 |
| 44312.489583333336 | 11.97 |
| 44312.5 | 12.26 |
| 44312.510416666664 | 11.37 |
| 44312.520833333336 | 10.81 |
| 44312.53125 | 10.1 |
| 44312.541666666664 | 8.18 |
| 44312.552083333336 | 8.48 |
| 44312.5625 | 8.46 |
| 44312.572916666664 | 8.11 |
| 44312.583333333336 | 8.73 |
| 44312.59375 | 9.41 |
| 44312.604166666664 | 9.09 |
| 44312.614583333336 | 9.17 |
| 44312.625 | 12.73 |
| 44312.635416666664 | 14.43 |
| 44312.645833333336 | 15.4 |
| 44312.65625 | 13.17 |
| 44312.666666666664 | 21.29 |
| 44312.677083333336 | 20.62 |
| 44312.6875 | 20.18 |
| 44312.697916666664 | 21.55 |
| 44312.708333333336 | 21.08 |
| 44312.71875 | 22.03 |
| 44312.729166666664 | 21.25 |
| 44312.739583333336 | 19.31 |
| 44312.75 | 24.55 |
| 44312.760416666664 | 20.53 |
| 44312.770833333336 | 15.79 |
| 44312.78125 | 18.15 |
| 44312.791666666664 | 13.35 |
| 44312.802083333336 | 14.06 |
| 44312.8125 | 17.16 |
| 44312.822916666664 | 16.01 |
| 44312.833333333336 | 16.68 |
| 44312.84375 | 19.68 |
| 44312.854166666664 | 20.95 |
| 44312.864583333336 | 22.36 |
| 44312.875 | 22.51 |
| 44312.885416666664 | 21.95 |
| 44312.895833333336 | 20.77 |
| 44312.90625 | 20 |
| 44312.916666666664 | 25.45 |
| 44312.927083333336 | 28 |
| 44312.9375 | 30.51 |
| 44312.947916666664 | 25.37 |
| 44312.958333333336 | 23.06 |
| 44312.96875 | 21.53 |
| 44312.979166666664 | 18.72 |
| 44312.989583333336 | 17.53 |
| 44313.0 | 15.33 |
| 44313.010416666664 | 14.22 |
| 44313.020833333336 | 12.68 |
| 44313.03125 | 12.62 |
| 44313.041666666664 | 11.12 |
| 44313.052083333336 | 10.16 |
| 44313.0625 | 9.79 |
| 44313.072916666664 | 8.55 |
| 44313.083333333336 | 8.81 |
| 44313.09375 | 8.58 |
| 44313.104166666664 | 8.19 |
| 44313.114583333336 | 7.91 |
| 44313.125 | 9.18 |
| 44313.135416666664 | 11.62 |
| 44313.145833333336 | 10.29 |
| 44313.15625 | 15.69 |
| 44313.166666666664 | 12.91 |
| 44313.177083333336 | 22.8 |
| 44313.1875 | 27.23 |
| 44313.197916666664 | 29.61 |
| 44313.208333333336 | 31.22 |
| 44313.21875 | 39.52 |
| 44313.229166666664 | 40.79 |
| 44313.239583333336 | 39.79 |
| 44313.25 | 40.45 |
| 44313.260416666664 | 33.58 |
| 44313.270833333336 | 30.55 |
| 44313.28125 | 29.72 |
| 44313.291666666664 | 26.87 |
| 44313.302083333336 | 23.74 |
| 44313.3125 | 19.95 |
| 44313.322916666664 | 18.66 |
| 44313.333333333336 | 16.64 |
| 44313.34375 | 16.88 |
| 44313.354166666664 | 17.44 |
| 44313.364583333336 | 17.57 |
| 44313.375 | 17.69 |
| 44313.385416666664 | 23.57 |
| 44313.395833333336 | 21.38 |
| 44313.40625 | 19.97 |
| 44313.416666666664 | 19.01 |
| 44313.427083333336 | 20.77 |
| 44313.4375 | 20.7 |
| 44313.447916666664 | 21.3 |
| 44313.458333333336 | 20.62 |
| 44313.46875 | 20.55 |
| 44313.479166666664 | 17.85 |
| 44313.489583333336 | 17.6 |
| 44313.5 | 16.51 |
| 44313.510416666664 | 15.45 |
| 44313.520833333336 | 11.79 |
| 44313.53125 | 12.95 |
| 44313.541666666664 | 12.21 |
| 44313.552083333336 | 12.15 |
| 44313.5625 | 10.65 |
| 44313.572916666664 | 9.02 |
| 44313.583333333336 | 9.07 |
| 44313.59375 | 9.01 |
| 44313.604166666664 | 8.06 |
| 44313.614583333336 | 9 |
| 44313.625 | 9.52 |
| 44313.635416666664 | 11.97 |
| 44313.645833333336 | 13.26 |
| 44313.65625 | 16.04 |
| 44313.666666666664 | 14.68 |
| 44313.677083333336 | 14.86 |
| 44313.6875 | 14.86 |
| 44313.697916666664 | 17.77 |
| 44313.708333333336 | 19.74 |
| 44313.71875 | 20.99 |
| 44313.729166666664 | 21.56 |
| 44313.739583333336 | 23.03 |
| 44313.75 | 23.97 |
| 44313.760416666664 | 23.17 |
| 44313.770833333336 | 23.02 |
| 44313.78125 | 23.92 |
| 44313.791666666664 | 18.55 |
| 44313.802083333336 | 19.68 |
| 44313.8125 | 18.01 |
| 44313.822916666664 | 16.7 |
| 44313.833333333336 | 17.56 |
| 44313.84375 | 18.97 |
| 44313.854166666664 | 19.34 |
| 44313.864583333336 | 20.58 |
| 44313.875 | 22.47 |
| 44313.885416666664 | 29.2 |
| 44313.895833333336 | 29.61 |
| 44313.90625 | 29.08 |
| 44313.916666666664 | 29.25 |
| 44313.927083333336 | 33.92 |
| 44313.9375 | 32.24 |
| 44313.947916666664 | 34.65 |
| 44313.958333333336 | 30.96 |
| 44313.96875 | 27.52 |
| 44313.979166666664 | 25.56 |
| 44313.989583333336 | 23.95 |
| 44314.0 | 21.15 |
| 44314.010416666664 | 19.36 |
| 44314.020833333336 | 17.57 |
| 44314.03125 | 16.09 |
| 44314.041666666664 | 14.35 |
| 44314.052083333336 | 13.17 |
| 44314.0625 | 12.72 |
| 44314.072916666664 | 11.93 |
| 44314.083333333336 | 9.87 |
| 44314.09375 | 10.23 |
| 44314.104166666664 | 7.88 |
| 44314.114583333336 | 9.26 |
| 44314.125 | 9.02 |
| 44314.135416666664 | 8.19 |
| 44314.145833333336 | 8.95 |
| 44314.15625 | 11.9 |
| 44314.166666666664 | 10.8 |
| 44314.177083333336 | 14.06 |
| 44314.1875 | 13.57 |
| 44314.197916666664 | 18.4 |
| 44314.208333333336 | 22.95 |
| 44314.21875 | 27.15 |
| 44314.229166666664 | 27.38 |
| 44314.239583333336 | 31.14 |
| 44314.25 | 34.38 |
| 44314.260416666664 | 35.55 |
| 44314.270833333336 | 38.81 |
| 44314.28125 | 42.99 |
| 44314.291666666664 | 42.7 |
| 44314.302083333336 | 39.07 |
| 44314.3125 | 39.25 |
| 44314.322916666664 | 29.06 |
| 44314.333333333336 | 26.09 |
| 44314.34375 | 24.09 |
| 44314.354166666664 | 21.36 |
| 44314.364583333336 | 19.76 |
| 44314.375 | 18.73 |
| 44314.385416666664 | 18.65 |
| 44314.395833333336 | 18.72 |
| 44314.40625 | 21.04 |
| 44314.416666666664 | 29.71 |
| 44314.427083333336 | 31.93 |
| 44314.4375 | 33.07 |
| 44314.447916666664 | 27.86 |
| 44314.458333333336 | 32.63 |
| 44314.46875 | 36.42 |
| 44314.479166666664 | 35.54 |
| 44314.489583333336 | 36.84 |
| 44314.5 | 41.03 |
| 44314.510416666664 | 44.54 |
| 44314.520833333336 | 41.03 |
| 44314.53125 | 34.97 |
| 44314.541666666664 | 30.45 |
| 44314.552083333336 | 28.86 |
| 44314.5625 | 25.53 |
| 44314.572916666664 | 21.14 |
| 44314.583333333336 | 15.25 |
| 44314.59375 | 14.76 |
| 44314.604166666664 | 13.31 |
| 44314.614583333336 | 14.58 |
| 44314.625 | 12.71 |
| 44314.635416666664 | 11.89 |
| 44314.645833333336 | 12.12 |
| 44314.65625 | 15.26 |
| 44314.666666666664 | 17.94 |
| 44314.677083333336 | 19.41 |
| 44314.6875 | 24.29 |
| 44314.697916666664 | 22.57 |
| 44314.708333333336 | 21.59 |
| 44314.71875 | 28.88 |
| 44314.729166666664 | 27.6 |
| 44314.739583333336 | 23.38 |
| 44314.75 | 26.38 |
| 44314.760416666664 | 23.81 |
| 44314.770833333336 | 21.92 |
| 44314.78125 | 21.14 |
| 44314.791666666664 | 20.46 |
| 44314.802083333336 | 19.92 |
| 44314.8125 | 18.24 |
| 44314.822916666664 | 18.49 |
| 44314.833333333336 | 18.99 |
| 44314.84375 | 21.13 |
| 44314.854166666664 | 15.11 |
| 44314.864583333336 | 18.21 |
| 44314.875 | 19.37 |
| 44314.885416666664 | 20.62 |
| 44314.895833333336 | 22.42 |
| 44314.90625 | 27.45 |
| 44314.916666666664 | 31.98 |
| 44314.927083333336 | 32.83 |
| 44314.9375 | 28.48 |
| 44314.947916666664 | 27.9 |
| 44314.958333333336 | 30.41 |
| 44314.96875 | 29.42 |
| 44314.979166666664 | 28.65 |
| 44314.989583333336 | 26.8 |
| 44315.0 | 28.22 |
| 44315.010416666664 | 26.11 |
| 44315.020833333336 | 24.78 |
| 44315.03125 | 21.81 |
| 44315.041666666664 | 19.63 |
| 44315.052083333336 | 19.04 |
| 44315.0625 | 16.36 |
| 44315.072916666664 | 15.53 |
| 44315.083333333336 | 14.85 |
| 44315.09375 | 13.46 |
| 44315.104166666664 | 11.55 |
| 44315.114583333336 | 11.43 |
| 44315.125 | 10.75 |
| 44315.135416666664 | 9.36 |
| 44315.145833333336 | 9.49 |
| 44315.15625 | 9.73 |
| 44315.166666666664 | 9.82 |
| 44315.177083333336 | 8.74 |
| 44315.1875 | 9.5 |
| 44315.197916666664 | 10.98 |
| 44315.208333333336 | 12.93 |
| 44315.21875 | 13.24 |
| 44315.229166666664 | 17.16 |
| 44315.239583333336 | 19.07 |
| 44315.25 | 20.14 |
| 44315.260416666664 | 26.48 |
| 44315.270833333336 | 27.89 |
| 44315.28125 | 28.6 |
| 44315.291666666664 | 37.97 |
| 44315.302083333336 | 37.93 |
| 44315.3125 | 41.17 |
| 44315.322916666664 | 41.59 |
| 44315.333333333336 | 36.67 |
| 44315.34375 | 34.39 |
| 44315.354166666664 | 31.55 |
| 44315.364583333336 | 23.19 |
| 44315.375 | 22.56 |
| 44315.385416666664 | 21.02 |
| 44315.395833333336 | 18.26 |
| 44315.40625 | 17.66 |
| 44315.416666666664 | 20.16 |
| 44315.427083333336 | 21.77 |
| 44315.4375 | 20.42 |
| 44315.447916666664 | 24.14 |
| 44315.458333333336 | 27.49 |
| 44315.46875 | 25.61 |
| 44315.479166666664 | 38.83 |
| 44315.489583333336 | 26.86 |
| 44315.5 | 27.69 |
| 44315.510416666664 | 28.94 |
| 44315.520833333336 | 28.74 |
| 44315.53125 | 28.05 |
| 44315.541666666664 | 27.08 |
| 44315.552083333336 | 31.72 |
| 44315.5625 | 26.63 |
| 44315.572916666664 | 26.01 |
| 44315.583333333336 | 22.67 |
| 44315.59375 | 23.78 |
| 44315.604166666664 | 19.49 |
| 44315.614583333336 | 19 |
| 44315.625 | 17.08 |
| 44315.635416666664 | 13.26 |
| 44315.645833333336 | 12.62 |
| 44315.65625 | 11.1 |
| 44315.666666666664 | 10.82 |
| 44315.677083333336 | 11.07 |
| 44315.6875 | 12.45 |
| 44315.697916666664 | 15.02 |
| 44315.708333333336 | 14.86 |
| 44315.71875 | 19.11 |
| 44315.729166666664 | 16.19 |
| 44315.739583333336 | 16.57 |
| 44315.75 | 16.37 |
| 44315.760416666664 | 16.56 |
| 44315.770833333336 | 18.82 |
| 44315.78125 | 19.82 |
| 44315.791666666664 | 19.33 |
| 44315.802083333336 | 20.62 |
| 44315.8125 | 21.28 |
| 44315.822916666664 | 19.52 |
| 44315.833333333336 | 21.58 |
| 44315.84375 | 21.12 |
| 44315.854166666664 | 21.21 |
| 44315.864583333336 | 21.06 |
| 44315.875 | 17.28 |
| 44315.885416666664 | 19.08 |
| 44315.895833333336 | 15.17 |
| 44315.90625 | 16.55 |
| 44315.916666666664 | 20 |
| 44315.927083333336 | 18.87 |
| 44315.9375 | 21.61 |
| 44315.947916666664 | 32.82 |
| 44315.958333333336 | 40.19 |
| 44315.96875 | 40.26 |
| 44315.979166666664 | 41.32 |
| 44315.989583333336 | 39.91 |
| 44316.0 | 39.44 |
| 44316.010416666664 | 42.04 |
| 44316.020833333336 | 40.25 |
| 44316.03125 | 38.6 |
| 44316.041666666664 | 36.83 |
| 44316.052083333336 | 35.79 |
| 44316.0625 | 31.01 |
| 44316.072916666664 | 28.44 |
| 44316.083333333336 | 19.86 |
| 44316.09375 | 21.66 |
| 44316.104166666664 | 19.32 |
| 44316.114583333336 | 17.79 |
| 44316.125 | 15.96 |
| 44316.135416666664 | 21.42 |
| 44316.145833333336 | 13 |
| 44316.15625 | 12.31 |
| 44316.166666666664 | 12.46 |
| 44316.177083333336 | 9.99 |
| 44316.1875 | 10.73 |
| 44316.197916666664 | 10.53 |
| 44316.208333333336 | 10.29 |
| 44316.21875 | 10.52 |
| 44316.229166666664 | 11.56 |
| 44316.239583333336 | 14.18 |
| 44316.25 | 13.05 |
| 44316.260416666664 | 15.91 |
| 44316.270833333336 | 18.37 |
| 44316.28125 | 20.62 |
| 44316.291666666664 | 24.17 |
| 44316.302083333336 | 31.14 |
| 44316.3125 | 30.04 |
| 44316.322916666664 | 29.57 |
| 44316.333333333336 | 35.98 |
| 44316.34375 | 46.47 |
| 44316.354166666664 | 48.85 |
| 44316.364583333336 | 38.89 |
| 44316.375 | 41.25 |
| 44316.385416666664 | 36.23 |
| 44316.395833333336 | 31.83 |
| 44316.40625 | 25.36 |
| 44316.416666666664 | 23.75 |
| 44316.427083333336 | 21.36 |
| 44316.4375 | 20 |
| 44316.447916666664 | 19.36 |
| 44316.458333333336 | 21.62 |
| 44316.46875 | 23.92 |
| 44316.479166666664 | 25.28 |
| 44316.489583333336 | 25.16 |
| 44316.5 | 31.9 |
| 44316.510416666664 | 28.92 |
| 44316.520833333336 | 27.43 |
| 44316.53125 | 28.2 |
| 44316.541666666664 | 22.94 |
| 44316.552083333336 | 21.89 |
| 44316.5625 | 22.38 |
| 44316.572916666664 | 24.86 |
| 44316.583333333336 | 23.84 |
| 44316.59375 | 25.48 |
| 44316.604166666664 | 25.1 |
| 44316.614583333336 | 25.41 |
| 44316.625 | 25.36 |
| 44316.635416666664 | 23.54 |
| 44316.645833333336 | 23.82 |
| 44316.65625 | 19.68 |
| 44316.666666666664 | 19.15 |
| 44316.677083333336 | 18.1 |
| 44316.6875 | 15.32 |
| 44316.697916666664 | 13.4 |
| 44316.708333333336 | 12.6 |
| 44316.71875 | 11.67 |
| 44316.729166666664 | 15.16 |
| 44316.739583333336 | 16.41 |
| 44316.75 | 16.56 |
| 44316.760416666664 | 17.57 |
| 44316.770833333336 | 16.9 |
| 44316.78125 | 16.19 |
| 44316.791666666664 | 17.12 |
| 44316.802083333336 | 18.81 |
| 44316.8125 | 17.72 |
| 44316.822916666664 | 19.12 |
| 44316.833333333336 | 18.76 |
| 44316.84375 | 18.33 |
| 44316.854166666664 | 17.06 |
| 44316.864583333336 | 19.04 |
| 44316.875 | 18.05 |
| 44316.885416666664 | 19.56 |
| 44316.895833333336 | 22.61 |
| 44316.90625 | 22.15 |
| 44316.916666666664 | 18.15 |
| 44316.927083333336 | 17.95 |
| 44316.9375 | 18.2 |
| 44316.947916666664 | 19.57 |
| 44316.958333333336 | 21.52 |
| 44316.96875 | 21.99 |
| 44316.979166666664 | 27.17 |
| 44316.989583333336 | 23.84 |
| 44317.0 | 23.11 |
| 44317.010416666664 | 20.99 |
| 44317.020833333336 | 17.37 |
| 44317.03125 | 24.28 |
| 44317.041666666664 | 32.55 |
| 44317.052083333336 | 45.98 |
| 44317.0625 | 48.89 |
| 44317.072916666664 | 47.37 |
| 44317.083333333336 | 53.51 |
| 44317.09375 | 63.49 |
| 44317.104166666664 | 59.18 |
| 44317.114583333336 | 51.37 |
| 44317.125 | 49.52 |
| 44317.135416666664 | 39.94 |
| 44317.145833333336 | 38.19 |
| 44317.15625 | 33.55 |